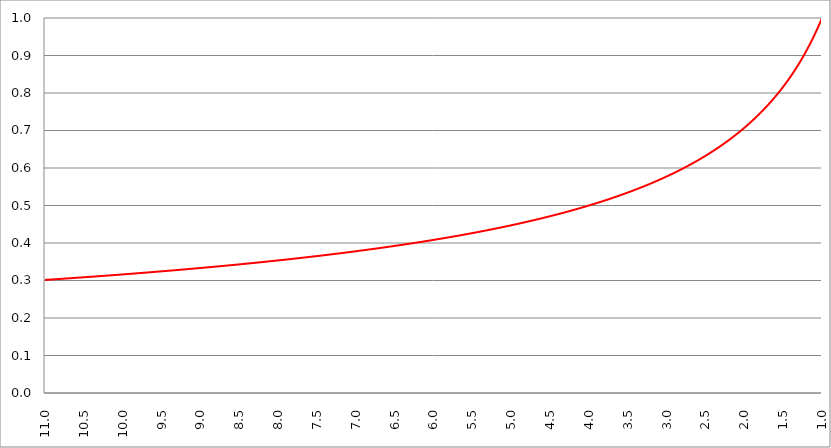
| Category | Series 1 | Series 0 | Series 2 |
|---|---|---|---|
| 11.0 | 0.302 |  |  |
| 10.995 | 0.302 |  |  |
| 10.99 | 0.302 |  |  |
| 10.985 | 0.302 |  |  |
| 10.98 | 0.302 |  |  |
| 10.975 | 0.302 |  |  |
| 10.97 | 0.302 |  |  |
| 10.96499999999999 | 0.302 |  |  |
| 10.96 | 0.302 |  |  |
| 10.955 | 0.302 |  |  |
| 10.95 | 0.302 |  |  |
| 10.945 | 0.302 |  |  |
| 10.94 | 0.302 |  |  |
| 10.93499999999999 | 0.302 |  |  |
| 10.92999999999999 | 0.302 |  |  |
| 10.92499999999999 | 0.303 |  |  |
| 10.91999999999999 | 0.303 |  |  |
| 10.91499999999999 | 0.303 |  |  |
| 10.90999999999999 | 0.303 |  |  |
| 10.90499999999999 | 0.303 |  |  |
| 10.89999999999998 | 0.303 |  |  |
| 10.89499999999998 | 0.303 |  |  |
| 10.88999999999998 | 0.303 |  |  |
| 10.88499999999998 | 0.303 |  |  |
| 10.87999999999998 | 0.303 |  |  |
| 10.87499999999998 | 0.303 |  |  |
| 10.86999999999998 | 0.303 |  |  |
| 10.86499999999998 | 0.303 |  |  |
| 10.85999999999998 | 0.303 |  |  |
| 10.85499999999998 | 0.304 |  |  |
| 10.84999999999998 | 0.304 |  |  |
| 10.84499999999998 | 0.304 |  |  |
| 10.83999999999997 | 0.304 |  |  |
| 10.83499999999997 | 0.304 |  |  |
| 10.82999999999997 | 0.304 |  |  |
| 10.82499999999997 | 0.304 |  |  |
| 10.81999999999997 | 0.304 |  |  |
| 10.81499999999997 | 0.304 |  |  |
| 10.80999999999997 | 0.304 |  |  |
| 10.80499999999997 | 0.304 |  |  |
| 10.79999999999997 | 0.304 |  |  |
| 10.79499999999997 | 0.304 |  |  |
| 10.78999999999997 | 0.304 |  |  |
| 10.78499999999997 | 0.305 |  |  |
| 10.77999999999997 | 0.305 |  |  |
| 10.77499999999996 | 0.305 |  |  |
| 10.76999999999996 | 0.305 |  |  |
| 10.76499999999996 | 0.305 |  |  |
| 10.75999999999996 | 0.305 |  |  |
| 10.75499999999996 | 0.305 |  |  |
| 10.74999999999996 | 0.305 |  |  |
| 10.74499999999996 | 0.305 |  |  |
| 10.73999999999996 | 0.305 |  |  |
| 10.73499999999996 | 0.305 |  |  |
| 10.72999999999996 | 0.305 |  |  |
| 10.72499999999996 | 0.305 |  |  |
| 10.71999999999996 | 0.305 |  |  |
| 10.71499999999996 | 0.305 |  |  |
| 10.70999999999995 | 0.306 |  |  |
| 10.70499999999995 | 0.306 |  |  |
| 10.69999999999995 | 0.306 |  |  |
| 10.69499999999995 | 0.306 |  |  |
| 10.68999999999995 | 0.306 |  |  |
| 10.68499999999995 | 0.306 |  |  |
| 10.67999999999995 | 0.306 |  |  |
| 10.67499999999995 | 0.306 |  |  |
| 10.66999999999995 | 0.306 |  |  |
| 10.66499999999995 | 0.306 |  |  |
| 10.65999999999995 | 0.306 |  |  |
| 10.65499999999995 | 0.306 |  |  |
| 10.64999999999995 | 0.306 |  |  |
| 10.64499999999994 | 0.306 |  |  |
| 10.63999999999994 | 0.307 |  |  |
| 10.63499999999994 | 0.307 |  |  |
| 10.62999999999994 | 0.307 |  |  |
| 10.62499999999994 | 0.307 |  |  |
| 10.61999999999994 | 0.307 |  |  |
| 10.61499999999994 | 0.307 |  |  |
| 10.60999999999994 | 0.307 |  |  |
| 10.60499999999994 | 0.307 |  |  |
| 10.59999999999994 | 0.307 |  |  |
| 10.59499999999994 | 0.307 |  |  |
| 10.58999999999994 | 0.307 |  |  |
| 10.58499999999994 | 0.307 |  |  |
| 10.57999999999993 | 0.307 |  |  |
| 10.57499999999993 | 0.308 |  |  |
| 10.56999999999993 | 0.308 |  |  |
| 10.56499999999993 | 0.308 |  |  |
| 10.55999999999993 | 0.308 |  |  |
| 10.55499999999993 | 0.308 |  |  |
| 10.54999999999993 | 0.308 |  |  |
| 10.54499999999993 | 0.308 |  |  |
| 10.53999999999993 | 0.308 |  |  |
| 10.53499999999993 | 0.308 |  |  |
| 10.52999999999993 | 0.308 |  |  |
| 10.52499999999993 | 0.308 |  |  |
| 10.51999999999992 | 0.308 |  |  |
| 10.51499999999992 | 0.308 |  |  |
| 10.50999999999992 | 0.308 |  |  |
| 10.50499999999992 | 0.309 |  |  |
| 10.49999999999992 | 0.309 |  |  |
| 10.49499999999992 | 0.309 |  |  |
| 10.48999999999992 | 0.309 |  |  |
| 10.48499999999992 | 0.309 |  |  |
| 10.47999999999992 | 0.309 |  |  |
| 10.47499999999992 | 0.309 |  |  |
| 10.46999999999992 | 0.309 |  |  |
| 10.46499999999992 | 0.309 |  |  |
| 10.45999999999992 | 0.309 |  |  |
| 10.45499999999991 | 0.309 |  |  |
| 10.44999999999991 | 0.309 |  |  |
| 10.44499999999991 | 0.309 |  |  |
| 10.43999999999991 | 0.309 |  |  |
| 10.43499999999991 | 0.31 |  |  |
| 10.42999999999991 | 0.31 |  |  |
| 10.42499999999991 | 0.31 |  |  |
| 10.41999999999991 | 0.31 |  |  |
| 10.41499999999991 | 0.31 |  |  |
| 10.40999999999991 | 0.31 |  |  |
| 10.40499999999991 | 0.31 |  |  |
| 10.39999999999991 | 0.31 |  |  |
| 10.39499999999991 | 0.31 |  |  |
| 10.3899999999999 | 0.31 |  |  |
| 10.3849999999999 | 0.31 |  |  |
| 10.3799999999999 | 0.31 |  |  |
| 10.3749999999999 | 0.31 |  |  |
| 10.3699999999999 | 0.311 |  |  |
| 10.3649999999999 | 0.311 |  |  |
| 10.3599999999999 | 0.311 |  |  |
| 10.3549999999999 | 0.311 |  |  |
| 10.3499999999999 | 0.311 |  |  |
| 10.3449999999999 | 0.311 |  |  |
| 10.3399999999999 | 0.311 |  |  |
| 10.3349999999999 | 0.311 |  |  |
| 10.3299999999999 | 0.311 |  |  |
| 10.32499999999989 | 0.311 |  |  |
| 10.31999999999989 | 0.311 |  |  |
| 10.31499999999989 | 0.311 |  |  |
| 10.3099999999999 | 0.311 |  |  |
| 10.3049999999999 | 0.312 |  |  |
| 10.2999999999999 | 0.312 |  |  |
| 10.29499999999989 | 0.312 |  |  |
| 10.28999999999989 | 0.312 |  |  |
| 10.28499999999989 | 0.312 |  |  |
| 10.27999999999989 | 0.312 |  |  |
| 10.27499999999989 | 0.312 |  |  |
| 10.26999999999989 | 0.312 |  |  |
| 10.26499999999989 | 0.312 |  |  |
| 10.25999999999988 | 0.312 |  |  |
| 10.25499999999988 | 0.312 |  |  |
| 10.24999999999988 | 0.312 |  |  |
| 10.24499999999988 | 0.312 |  |  |
| 10.23999999999988 | 0.313 |  |  |
| 10.23499999999988 | 0.313 |  |  |
| 10.22999999999988 | 0.313 |  |  |
| 10.22499999999988 | 0.313 |  |  |
| 10.21999999999988 | 0.313 |  |  |
| 10.21499999999988 | 0.313 |  |  |
| 10.20999999999988 | 0.313 |  |  |
| 10.20499999999988 | 0.313 |  |  |
| 10.19999999999987 | 0.313 |  |  |
| 10.19499999999987 | 0.313 |  |  |
| 10.18999999999987 | 0.313 |  |  |
| 10.18499999999987 | 0.313 |  |  |
| 10.17999999999987 | 0.313 |  |  |
| 10.17499999999987 | 0.313 |  |  |
| 10.16999999999987 | 0.314 |  |  |
| 10.16499999999987 | 0.314 |  |  |
| 10.15999999999987 | 0.314 |  |  |
| 10.15499999999987 | 0.314 |  |  |
| 10.14999999999987 | 0.314 |  |  |
| 10.14499999999987 | 0.314 |  |  |
| 10.13999999999987 | 0.314 |  |  |
| 10.13499999999986 | 0.314 |  |  |
| 10.12999999999986 | 0.314 |  |  |
| 10.12499999999986 | 0.314 |  |  |
| 10.11999999999986 | 0.314 |  |  |
| 10.11499999999986 | 0.314 |  |  |
| 10.10999999999986 | 0.315 |  |  |
| 10.10499999999986 | 0.315 |  |  |
| 10.09999999999986 | 0.315 |  |  |
| 10.09499999999986 | 0.315 |  |  |
| 10.08999999999986 | 0.315 |  |  |
| 10.08499999999986 | 0.315 |  |  |
| 10.07999999999986 | 0.315 |  |  |
| 10.07499999999986 | 0.315 |  |  |
| 10.06999999999985 | 0.315 |  |  |
| 10.06499999999985 | 0.315 |  |  |
| 10.05999999999985 | 0.315 |  |  |
| 10.05499999999985 | 0.315 |  |  |
| 10.04999999999985 | 0.315 |  |  |
| 10.04499999999985 | 0.316 |  |  |
| 10.03999999999985 | 0.316 |  |  |
| 10.03499999999985 | 0.316 |  |  |
| 10.02999999999985 | 0.316 |  |  |
| 10.02499999999985 | 0.316 |  |  |
| 10.01999999999985 | 0.316 |  |  |
| 10.01499999999985 | 0.316 |  |  |
| 10.00999999999985 | 0.316 |  |  |
| 10.00499999999984 | 0.316 |  |  |
| 9.999999999999844 | 0.316 |  |  |
| 9.994999999999841 | 0.316 |  |  |
| 9.98999999999984 | 0.316 |  |  |
| 9.98499999999984 | 0.316 |  |  |
| 9.97999999999984 | 0.317 |  |  |
| 9.97499999999984 | 0.317 |  |  |
| 9.969999999999837 | 0.317 |  |  |
| 9.964999999999838 | 0.317 |  |  |
| 9.959999999999837 | 0.317 |  |  |
| 9.954999999999837 | 0.317 |  |  |
| 9.949999999999836 | 0.317 |  |  |
| 9.944999999999835 | 0.317 |  |  |
| 9.939999999999834 | 0.317 |  |  |
| 9.934999999999834 | 0.317 |  |  |
| 9.929999999999833 | 0.317 |  |  |
| 9.92499999999983 | 0.317 |  |  |
| 9.91999999999983 | 0.318 |  |  |
| 9.91499999999983 | 0.318 |  |  |
| 9.90999999999983 | 0.318 |  |  |
| 9.904999999999829 | 0.318 |  |  |
| 9.899999999999826 | 0.318 |  |  |
| 9.894999999999827 | 0.318 |  |  |
| 9.889999999999826 | 0.318 |  |  |
| 9.884999999999826 | 0.318 |  |  |
| 9.879999999999823 | 0.318 |  |  |
| 9.874999999999824 | 0.318 |  |  |
| 9.869999999999823 | 0.318 |  |  |
| 9.864999999999823 | 0.318 |  |  |
| 9.85999999999982 | 0.318 |  |  |
| 9.85499999999982 | 0.319 |  |  |
| 9.84999999999982 | 0.319 |  |  |
| 9.84499999999982 | 0.319 |  |  |
| 9.839999999999819 | 0.319 |  |  |
| 9.834999999999818 | 0.319 |  |  |
| 9.829999999999817 | 0.319 |  |  |
| 9.824999999999816 | 0.319 |  |  |
| 9.819999999999816 | 0.319 |  |  |
| 9.814999999999815 | 0.319 |  |  |
| 9.809999999999812 | 0.319 |  |  |
| 9.804999999999813 | 0.319 |  |  |
| 9.799999999999812 | 0.319 |  |  |
| 9.794999999999812 | 0.32 |  |  |
| 9.78999999999981 | 0.32 |  |  |
| 9.78499999999981 | 0.32 |  |  |
| 9.77999999999981 | 0.32 |  |  |
| 9.774999999999809 | 0.32 |  |  |
| 9.769999999999808 | 0.32 |  |  |
| 9.764999999999807 | 0.32 |  |  |
| 9.759999999999806 | 0.32 |  |  |
| 9.754999999999805 | 0.32 |  |  |
| 9.749999999999805 | 0.32 |  |  |
| 9.744999999999804 | 0.32 |  |  |
| 9.739999999999803 | 0.32 |  |  |
| 9.734999999999802 | 0.321 |  |  |
| 9.729999999999801 | 0.321 |  |  |
| 9.7249999999998 | 0.321 |  |  |
| 9.7199999999998 | 0.321 |  |  |
| 9.7149999999998 | 0.321 |  |  |
| 9.709999999999798 | 0.321 |  |  |
| 9.704999999999798 | 0.321 |  |  |
| 9.699999999999797 | 0.321 |  |  |
| 9.694999999999794 | 0.321 |  |  |
| 9.689999999999795 | 0.321 |  |  |
| 9.684999999999794 | 0.321 |  |  |
| 9.679999999999794 | 0.321 |  |  |
| 9.674999999999793 | 0.321 |  |  |
| 9.66999999999979 | 0.322 |  |  |
| 9.66499999999979 | 0.322 |  |  |
| 9.65999999999979 | 0.322 |  |  |
| 9.65499999999979 | 0.322 |  |  |
| 9.649999999999787 | 0.322 |  |  |
| 9.644999999999788 | 0.322 |  |  |
| 9.639999999999787 | 0.322 |  |  |
| 9.634999999999787 | 0.322 |  |  |
| 9.629999999999786 | 0.322 |  |  |
| 9.624999999999785 | 0.322 |  |  |
| 9.619999999999784 | 0.322 |  |  |
| 9.614999999999783 | 0.322 |  |  |
| 9.609999999999783 | 0.323 |  |  |
| 9.60499999999978 | 0.323 |  |  |
| 9.59999999999978 | 0.323 |  |  |
| 9.59499999999978 | 0.323 |  |  |
| 9.58999999999978 | 0.323 |  |  |
| 9.584999999999779 | 0.323 |  |  |
| 9.579999999999778 | 0.323 |  |  |
| 9.574999999999777 | 0.323 |  |  |
| 9.569999999999776 | 0.323 |  |  |
| 9.564999999999776 | 0.323 |  |  |
| 9.559999999999773 | 0.323 |  |  |
| 9.554999999999774 | 0.324 |  |  |
| 9.549999999999773 | 0.324 |  |  |
| 9.544999999999773 | 0.324 |  |  |
| 9.539999999999772 | 0.324 |  |  |
| 9.534999999999771 | 0.324 |  |  |
| 9.52999999999977 | 0.324 |  |  |
| 9.52499999999977 | 0.324 |  |  |
| 9.519999999999769 | 0.324 |  |  |
| 9.514999999999768 | 0.324 |  |  |
| 9.509999999999767 | 0.324 |  |  |
| 9.504999999999766 | 0.324 |  |  |
| 9.499999999999766 | 0.324 |  |  |
| 9.494999999999765 | 0.325 |  |  |
| 9.489999999999762 | 0.325 |  |  |
| 9.484999999999763 | 0.325 |  |  |
| 9.47999999999976 | 0.325 |  |  |
| 9.47499999999976 | 0.325 |  |  |
| 9.46999999999976 | 0.325 |  |  |
| 9.46499999999976 | 0.325 |  |  |
| 9.45999999999976 | 0.325 |  |  |
| 9.454999999999758 | 0.325 |  |  |
| 9.449999999999758 | 0.325 |  |  |
| 9.444999999999757 | 0.325 |  |  |
| 9.439999999999756 | 0.325 |  |  |
| 9.434999999999755 | 0.326 |  |  |
| 9.429999999999755 | 0.326 |  |  |
| 9.424999999999754 | 0.326 |  |  |
| 9.419999999999751 | 0.326 |  |  |
| 9.414999999999752 | 0.326 |  |  |
| 9.40999999999975 | 0.326 |  |  |
| 9.40499999999975 | 0.326 |  |  |
| 9.39999999999975 | 0.326 |  |  |
| 9.39499999999975 | 0.326 |  |  |
| 9.389999999999748 | 0.326 |  |  |
| 9.384999999999748 | 0.326 |  |  |
| 9.379999999999747 | 0.327 |  |  |
| 9.374999999999744 | 0.327 |  |  |
| 9.369999999999745 | 0.327 |  |  |
| 9.364999999999744 | 0.327 |  |  |
| 9.35999999999974 | 0.327 |  |  |
| 9.35499999999974 | 0.327 |  |  |
| 9.34999999999974 | 0.327 |  |  |
| 9.34499999999974 | 0.327 |  |  |
| 9.33999999999974 | 0.327 |  |  |
| 9.33499999999974 | 0.327 |  |  |
| 9.329999999999737 | 0.327 |  |  |
| 9.324999999999738 | 0.327 |  |  |
| 9.319999999999737 | 0.328 |  |  |
| 9.314999999999737 | 0.328 |  |  |
| 9.309999999999736 | 0.328 |  |  |
| 9.304999999999733 | 0.328 |  |  |
| 9.299999999999734 | 0.328 |  |  |
| 9.294999999999733 | 0.328 |  |  |
| 9.289999999999733 | 0.328 |  |  |
| 9.28499999999973 | 0.328 |  |  |
| 9.27999999999973 | 0.328 |  |  |
| 9.27499999999973 | 0.328 |  |  |
| 9.26999999999973 | 0.328 |  |  |
| 9.264999999999729 | 0.329 |  |  |
| 9.259999999999726 | 0.329 |  |  |
| 9.254999999999727 | 0.329 |  |  |
| 9.249999999999726 | 0.329 |  |  |
| 9.244999999999726 | 0.329 |  |  |
| 9.239999999999725 | 0.329 |  |  |
| 9.234999999999724 | 0.329 |  |  |
| 9.229999999999723 | 0.329 |  |  |
| 9.224999999999723 | 0.329 |  |  |
| 9.219999999999722 | 0.329 |  |  |
| 9.214999999999721 | 0.329 |  |  |
| 9.20999999999972 | 0.33 |  |  |
| 9.20499999999972 | 0.33 |  |  |
| 9.199999999999719 | 0.33 |  |  |
| 9.194999999999718 | 0.33 |  |  |
| 9.189999999999717 | 0.33 |  |  |
| 9.184999999999716 | 0.33 |  |  |
| 9.179999999999715 | 0.33 |  |  |
| 9.174999999999715 | 0.33 |  |  |
| 9.169999999999712 | 0.33 |  |  |
| 9.164999999999713 | 0.33 |  |  |
| 9.15999999999971 | 0.33 |  |  |
| 9.15499999999971 | 0.33 |  |  |
| 9.14999999999971 | 0.331 |  |  |
| 9.14499999999971 | 0.331 |  |  |
| 9.13999999999971 | 0.331 |  |  |
| 9.134999999999708 | 0.331 |  |  |
| 9.129999999999708 | 0.331 |  |  |
| 9.124999999999707 | 0.331 |  |  |
| 9.119999999999706 | 0.331 |  |  |
| 9.114999999999705 | 0.331 |  |  |
| 9.109999999999705 | 0.331 |  |  |
| 9.104999999999704 | 0.331 |  |  |
| 9.099999999999701 | 0.331 |  |  |
| 9.094999999999702 | 0.332 |  |  |
| 9.0899999999997 | 0.332 |  |  |
| 9.0849999999997 | 0.332 |  |  |
| 9.0799999999997 | 0.332 |  |  |
| 9.0749999999997 | 0.332 |  |  |
| 9.069999999999698 | 0.332 |  |  |
| 9.064999999999698 | 0.332 |  |  |
| 9.059999999999697 | 0.332 |  |  |
| 9.054999999999694 | 0.332 |  |  |
| 9.049999999999695 | 0.332 |  |  |
| 9.044999999999694 | 0.333 |  |  |
| 9.039999999999694 | 0.333 |  |  |
| 9.034999999999693 | 0.333 |  |  |
| 9.02999999999969 | 0.333 |  |  |
| 9.02499999999969 | 0.333 |  |  |
| 9.01999999999969 | 0.333 |  |  |
| 9.01499999999969 | 0.333 |  |  |
| 9.009999999999687 | 0.333 |  |  |
| 9.004999999999688 | 0.333 |  |  |
| 8.999999999999687 | 0.333 |  |  |
| 8.994999999999687 | 0.333 |  |  |
| 8.989999999999686 | 0.334 |  |  |
| 8.984999999999683 | 0.334 |  |  |
| 8.979999999999684 | 0.334 |  |  |
| 8.974999999999683 | 0.334 |  |  |
| 8.96999999999968 | 0.334 |  |  |
| 8.96499999999968 | 0.334 |  |  |
| 8.95999999999968 | 0.334 |  |  |
| 8.95499999999968 | 0.334 |  |  |
| 8.94999999999968 | 0.334 |  |  |
| 8.944999999999679 | 0.334 |  |  |
| 8.939999999999676 | 0.334 |  |  |
| 8.934999999999677 | 0.335 |  |  |
| 8.929999999999676 | 0.335 |  |  |
| 8.924999999999676 | 0.335 |  |  |
| 8.919999999999675 | 0.335 |  |  |
| 8.914999999999674 | 0.335 |  |  |
| 8.909999999999673 | 0.335 |  |  |
| 8.904999999999673 | 0.335 |  |  |
| 8.89999999999967 | 0.335 |  |  |
| 8.89499999999967 | 0.335 |  |  |
| 8.88999999999967 | 0.335 |  |  |
| 8.88499999999967 | 0.335 |  |  |
| 8.879999999999669 | 0.336 |  |  |
| 8.874999999999668 | 0.336 |  |  |
| 8.869999999999665 | 0.336 |  |  |
| 8.864999999999666 | 0.336 |  |  |
| 8.859999999999665 | 0.336 |  |  |
| 8.854999999999665 | 0.336 |  |  |
| 8.849999999999662 | 0.336 |  |  |
| 8.844999999999663 | 0.336 |  |  |
| 8.83999999999966 | 0.336 |  |  |
| 8.83499999999966 | 0.336 |  |  |
| 8.82999999999966 | 0.337 |  |  |
| 8.82499999999966 | 0.337 |  |  |
| 8.81999999999966 | 0.337 |  |  |
| 8.814999999999658 | 0.337 |  |  |
| 8.809999999999658 | 0.337 |  |  |
| 8.804999999999657 | 0.337 |  |  |
| 8.799999999999656 | 0.337 |  |  |
| 8.794999999999655 | 0.337 |  |  |
| 8.789999999999655 | 0.337 |  |  |
| 8.784999999999654 | 0.337 |  |  |
| 8.779999999999651 | 0.337 |  |  |
| 8.774999999999652 | 0.338 |  |  |
| 8.76999999999965 | 0.338 |  |  |
| 8.76499999999965 | 0.338 |  |  |
| 8.75999999999965 | 0.338 |  |  |
| 8.754999999999647 | 0.338 |  |  |
| 8.749999999999648 | 0.338 |  |  |
| 8.744999999999647 | 0.338 |  |  |
| 8.739999999999647 | 0.338 |  |  |
| 8.734999999999644 | 0.338 |  |  |
| 8.729999999999645 | 0.338 |  |  |
| 8.724999999999644 | 0.339 |  |  |
| 8.719999999999644 | 0.339 |  |  |
| 8.714999999999643 | 0.339 |  |  |
| 8.70999999999964 | 0.339 |  |  |
| 8.70499999999964 | 0.339 |  |  |
| 8.69999999999964 | 0.339 |  |  |
| 8.69499999999964 | 0.339 |  |  |
| 8.689999999999637 | 0.339 |  |  |
| 8.684999999999638 | 0.339 |  |  |
| 8.679999999999637 | 0.339 |  |  |
| 8.674999999999637 | 0.34 |  |  |
| 8.669999999999636 | 0.34 |  |  |
| 8.664999999999633 | 0.34 |  |  |
| 8.659999999999634 | 0.34 |  |  |
| 8.654999999999633 | 0.34 |  |  |
| 8.649999999999633 | 0.34 |  |  |
| 8.644999999999632 | 0.34 |  |  |
| 8.63999999999963 | 0.34 |  |  |
| 8.63499999999963 | 0.34 |  |  |
| 8.62999999999963 | 0.34 |  |  |
| 8.624999999999629 | 0.341 |  |  |
| 8.619999999999626 | 0.341 |  |  |
| 8.614999999999627 | 0.341 |  |  |
| 8.609999999999626 | 0.341 |  |  |
| 8.604999999999626 | 0.341 |  |  |
| 8.599999999999625 | 0.341 |  |  |
| 8.594999999999624 | 0.341 |  |  |
| 8.589999999999623 | 0.341 |  |  |
| 8.584999999999622 | 0.341 |  |  |
| 8.57999999999962 | 0.341 |  |  |
| 8.57499999999962 | 0.341 |  |  |
| 8.56999999999962 | 0.342 |  |  |
| 8.56499999999962 | 0.342 |  |  |
| 8.559999999999619 | 0.342 |  |  |
| 8.554999999999618 | 0.342 |  |  |
| 8.549999999999617 | 0.342 |  |  |
| 8.544999999999616 | 0.342 |  |  |
| 8.539999999999615 | 0.342 |  |  |
| 8.534999999999615 | 0.342 |  |  |
| 8.529999999999612 | 0.342 |  |  |
| 8.524999999999613 | 0.342 |  |  |
| 8.51999999999961 | 0.343 |  |  |
| 8.51499999999961 | 0.343 |  |  |
| 8.50999999999961 | 0.343 |  |  |
| 8.50499999999961 | 0.343 |  |  |
| 8.49999999999961 | 0.343 |  |  |
| 8.494999999999608 | 0.343 |  |  |
| 8.489999999999608 | 0.343 |  |  |
| 8.484999999999607 | 0.343 |  |  |
| 8.479999999999606 | 0.343 |  |  |
| 8.474999999999605 | 0.344 |  |  |
| 8.469999999999605 | 0.344 |  |  |
| 8.464999999999604 | 0.344 |  |  |
| 8.4599999999996 | 0.344 |  |  |
| 8.4549999999996 | 0.344 |  |  |
| 8.4499999999996 | 0.344 |  |  |
| 8.4449999999996 | 0.344 |  |  |
| 8.4399999999996 | 0.344 |  |  |
| 8.4349999999996 | 0.344 |  |  |
| 8.429999999999598 | 0.344 |  |  |
| 8.424999999999597 | 0.345 |  |  |
| 8.419999999999597 | 0.345 |  |  |
| 8.414999999999594 | 0.345 |  |  |
| 8.409999999999595 | 0.345 |  |  |
| 8.404999999999594 | 0.345 |  |  |
| 8.399999999999594 | 0.345 |  |  |
| 8.394999999999593 | 0.345 |  |  |
| 8.38999999999959 | 0.345 |  |  |
| 8.38499999999959 | 0.345 |  |  |
| 8.37999999999959 | 0.345 |  |  |
| 8.37499999999959 | 0.346 |  |  |
| 8.369999999999589 | 0.346 |  |  |
| 8.364999999999588 | 0.346 |  |  |
| 8.359999999999587 | 0.346 |  |  |
| 8.354999999999587 | 0.346 |  |  |
| 8.349999999999586 | 0.346 |  |  |
| 8.344999999999585 | 0.346 |  |  |
| 8.339999999999584 | 0.346 |  |  |
| 8.334999999999583 | 0.346 |  |  |
| 8.329999999999583 | 0.346 |  |  |
| 8.324999999999582 | 0.347 |  |  |
| 8.31999999999958 | 0.347 |  |  |
| 8.31499999999958 | 0.347 |  |  |
| 8.30999999999958 | 0.347 |  |  |
| 8.304999999999579 | 0.347 |  |  |
| 8.299999999999578 | 0.347 |  |  |
| 8.294999999999577 | 0.347 |  |  |
| 8.289999999999576 | 0.347 |  |  |
| 8.284999999999576 | 0.347 |  |  |
| 8.279999999999575 | 0.348 |  |  |
| 8.274999999999574 | 0.348 |  |  |
| 8.269999999999573 | 0.348 |  |  |
| 8.264999999999572 | 0.348 |  |  |
| 8.259999999999572 | 0.348 |  |  |
| 8.254999999999571 | 0.348 |  |  |
| 8.24999999999957 | 0.348 |  |  |
| 8.24499999999957 | 0.348 |  |  |
| 8.239999999999569 | 0.348 |  |  |
| 8.234999999999568 | 0.348 |  |  |
| 8.229999999999567 | 0.349 |  |  |
| 8.224999999999566 | 0.349 |  |  |
| 8.219999999999565 | 0.349 |  |  |
| 8.214999999999565 | 0.349 |  |  |
| 8.209999999999564 | 0.349 |  |  |
| 8.204999999999563 | 0.349 |  |  |
| 8.199999999999562 | 0.349 |  |  |
| 8.194999999999562 | 0.349 |  |  |
| 8.18999999999956 | 0.349 |  |  |
| 8.18499999999956 | 0.35 |  |  |
| 8.17999999999956 | 0.35 |  |  |
| 8.174999999999558 | 0.35 |  |  |
| 8.169999999999558 | 0.35 |  |  |
| 8.164999999999557 | 0.35 |  |  |
| 8.159999999999556 | 0.35 |  |  |
| 8.154999999999555 | 0.35 |  |  |
| 8.149999999999554 | 0.35 |  |  |
| 8.144999999999554 | 0.35 |  |  |
| 8.139999999999553 | 0.35 |  |  |
| 8.134999999999552 | 0.351 |  |  |
| 8.129999999999551 | 0.351 |  |  |
| 8.12499999999955 | 0.351 |  |  |
| 8.11999999999955 | 0.351 |  |  |
| 8.11499999999955 | 0.351 |  |  |
| 8.109999999999548 | 0.351 |  |  |
| 8.104999999999547 | 0.351 |  |  |
| 8.099999999999547 | 0.351 |  |  |
| 8.094999999999544 | 0.351 |  |  |
| 8.089999999999545 | 0.352 |  |  |
| 8.084999999999544 | 0.352 |  |  |
| 8.079999999999544 | 0.352 |  |  |
| 8.074999999999543 | 0.352 |  |  |
| 8.06999999999954 | 0.352 |  |  |
| 8.06499999999954 | 0.352 |  |  |
| 8.05999999999954 | 0.352 |  |  |
| 8.05499999999954 | 0.352 |  |  |
| 8.049999999999539 | 0.352 |  |  |
| 8.044999999999538 | 0.353 |  |  |
| 8.039999999999537 | 0.353 |  |  |
| 8.034999999999537 | 0.353 |  |  |
| 8.029999999999536 | 0.353 |  |  |
| 8.024999999999535 | 0.353 |  |  |
| 8.019999999999534 | 0.353 |  |  |
| 8.014999999999533 | 0.353 |  |  |
| 8.009999999999533 | 0.353 |  |  |
| 8.004999999999532 | 0.353 |  |  |
| 7.999999999999531 | 0.354 |  |  |
| 7.994999999999532 | 0.354 |  |  |
| 7.989999999999532 | 0.354 |  |  |
| 7.984999999999532 | 0.354 |  |  |
| 7.979999999999532 | 0.354 |  |  |
| 7.974999999999532 | 0.354 |  |  |
| 7.969999999999532 | 0.354 |  |  |
| 7.964999999999533 | 0.354 |  |  |
| 7.959999999999532 | 0.354 |  |  |
| 7.954999999999533 | 0.355 |  |  |
| 7.949999999999532 | 0.355 |  |  |
| 7.944999999999533 | 0.355 |  |  |
| 7.939999999999533 | 0.355 |  |  |
| 7.934999999999533 | 0.355 |  |  |
| 7.929999999999533 | 0.355 |  |  |
| 7.924999999999534 | 0.355 |  |  |
| 7.919999999999533 | 0.355 |  |  |
| 7.914999999999534 | 0.355 |  |  |
| 7.909999999999533 | 0.356 |  |  |
| 7.904999999999534 | 0.356 |  |  |
| 7.899999999999534 | 0.356 |  |  |
| 7.894999999999534 | 0.356 |  |  |
| 7.889999999999534 | 0.356 |  |  |
| 7.884999999999534 | 0.356 |  |  |
| 7.879999999999534 | 0.356 |  |  |
| 7.874999999999534 | 0.356 |  |  |
| 7.869999999999534 | 0.356 |  |  |
| 7.864999999999535 | 0.357 |  |  |
| 7.859999999999534 | 0.357 |  |  |
| 7.854999999999535 | 0.357 |  |  |
| 7.849999999999535 | 0.357 |  |  |
| 7.844999999999535 | 0.357 |  |  |
| 7.839999999999535 | 0.357 |  |  |
| 7.834999999999535 | 0.357 |  |  |
| 7.829999999999535 | 0.357 |  |  |
| 7.824999999999536 | 0.357 |  |  |
| 7.819999999999535 | 0.358 |  |  |
| 7.814999999999536 | 0.358 |  |  |
| 7.809999999999535 | 0.358 |  |  |
| 7.804999999999536 | 0.358 |  |  |
| 7.799999999999536 | 0.358 |  |  |
| 7.794999999999536 | 0.358 |  |  |
| 7.789999999999536 | 0.358 |  |  |
| 7.784999999999536 | 0.358 |  |  |
| 7.779999999999536 | 0.359 |  |  |
| 7.774999999999536 | 0.359 |  |  |
| 7.769999999999536 | 0.359 |  |  |
| 7.764999999999537 | 0.359 |  |  |
| 7.759999999999536 | 0.359 |  |  |
| 7.754999999999537 | 0.359 |  |  |
| 7.749999999999537 | 0.359 |  |  |
| 7.744999999999537 | 0.359 |  |  |
| 7.739999999999537 | 0.359 |  |  |
| 7.734999999999537 | 0.36 |  |  |
| 7.729999999999537 | 0.36 |  |  |
| 7.724999999999538 | 0.36 |  |  |
| 7.719999999999537 | 0.36 |  |  |
| 7.714999999999538 | 0.36 |  |  |
| 7.709999999999538 | 0.36 |  |  |
| 7.704999999999538 | 0.36 |  |  |
| 7.699999999999538 | 0.36 |  |  |
| 7.694999999999538 | 0.36 |  |  |
| 7.689999999999538 | 0.361 |  |  |
| 7.684999999999539 | 0.361 |  |  |
| 7.679999999999538 | 0.361 |  |  |
| 7.674999999999539 | 0.361 |  |  |
| 7.669999999999539 | 0.361 |  |  |
| 7.664999999999539 | 0.361 |  |  |
| 7.65999999999954 | 0.361 |  |  |
| 7.654999999999539 | 0.361 |  |  |
| 7.64999999999954 | 0.362 |  |  |
| 7.644999999999539 | 0.362 |  |  |
| 7.63999999999954 | 0.362 |  |  |
| 7.63499999999954 | 0.362 |  |  |
| 7.62999999999954 | 0.362 |  |  |
| 7.62499999999954 | 0.362 |  |  |
| 7.61999999999954 | 0.362 |  |  |
| 7.61499999999954 | 0.362 |  |  |
| 7.60999999999954 | 0.362 |  |  |
| 7.60499999999954 | 0.363 |  |  |
| 7.59999999999954 | 0.363 |  |  |
| 7.594999999999541 | 0.363 |  |  |
| 7.58999999999954 | 0.363 |  |  |
| 7.584999999999541 | 0.363 |  |  |
| 7.57999999999954 | 0.363 |  |  |
| 7.574999999999541 | 0.363 |  |  |
| 7.569999999999541 | 0.363 |  |  |
| 7.564999999999541 | 0.364 |  |  |
| 7.559999999999541 | 0.364 |  |  |
| 7.554999999999541 | 0.364 |  |  |
| 7.549999999999541 | 0.364 |  |  |
| 7.544999999999542 | 0.364 |  |  |
| 7.539999999999541 | 0.364 |  |  |
| 7.534999999999542 | 0.364 |  |  |
| 7.529999999999542 | 0.364 |  |  |
| 7.524999999999542 | 0.365 |  |  |
| 7.519999999999542 | 0.365 |  |  |
| 7.514999999999542 | 0.365 |  |  |
| 7.509999999999542 | 0.365 |  |  |
| 7.504999999999542 | 0.365 |  |  |
| 7.499999999999542 | 0.365 |  |  |
| 7.494999999999543 | 0.365 |  |  |
| 7.489999999999542 | 0.365 |  |  |
| 7.484999999999543 | 0.366 |  |  |
| 7.479999999999542 | 0.366 |  |  |
| 7.474999999999543 | 0.366 |  |  |
| 7.469999999999543 | 0.366 |  |  |
| 7.464999999999543 | 0.366 |  |  |
| 7.459999999999543 | 0.366 |  |  |
| 7.454999999999544 | 0.366 |  |  |
| 7.449999999999543 | 0.366 |  |  |
| 7.444999999999544 | 0.366 |  |  |
| 7.439999999999543 | 0.367 |  |  |
| 7.434999999999544 | 0.367 |  |  |
| 7.429999999999544 | 0.367 |  |  |
| 7.424999999999544 | 0.367 |  |  |
| 7.419999999999544 | 0.367 |  |  |
| 7.414999999999544 | 0.367 |  |  |
| 7.409999999999544 | 0.367 |  |  |
| 7.404999999999544 | 0.367 |  |  |
| 7.399999999999544 | 0.368 |  |  |
| 7.394999999999545 | 0.368 |  |  |
| 7.389999999999544 | 0.368 |  |  |
| 7.384999999999545 | 0.368 |  |  |
| 7.379999999999545 | 0.368 |  |  |
| 7.374999999999545 | 0.368 |  |  |
| 7.369999999999545 | 0.368 |  |  |
| 7.364999999999545 | 0.368 |  |  |
| 7.359999999999545 | 0.369 |  |  |
| 7.354999999999546 | 0.369 |  |  |
| 7.349999999999545 | 0.369 |  |  |
| 7.344999999999546 | 0.369 |  |  |
| 7.339999999999545 | 0.369 |  |  |
| 7.334999999999546 | 0.369 |  |  |
| 7.329999999999546 | 0.369 |  |  |
| 7.324999999999546 | 0.369 |  |  |
| 7.319999999999546 | 0.37 |  |  |
| 7.314999999999546 | 0.37 |  |  |
| 7.309999999999546 | 0.37 |  |  |
| 7.304999999999547 | 0.37 |  |  |
| 7.299999999999546 | 0.37 |  |  |
| 7.294999999999547 | 0.37 |  |  |
| 7.289999999999547 | 0.37 |  |  |
| 7.284999999999547 | 0.37 |  |  |
| 7.279999999999547 | 0.371 |  |  |
| 7.274999999999547 | 0.371 |  |  |
| 7.269999999999547 | 0.371 |  |  |
| 7.264999999999548 | 0.371 |  |  |
| 7.259999999999547 | 0.371 |  |  |
| 7.254999999999548 | 0.371 |  |  |
| 7.249999999999547 | 0.371 |  |  |
| 7.244999999999548 | 0.372 |  |  |
| 7.239999999999548 | 0.372 |  |  |
| 7.234999999999548 | 0.372 |  |  |
| 7.229999999999548 | 0.372 |  |  |
| 7.224999999999548 | 0.372 |  |  |
| 7.219999999999548 | 0.372 |  |  |
| 7.214999999999549 | 0.372 |  |  |
| 7.209999999999548 | 0.372 |  |  |
| 7.204999999999549 | 0.373 |  |  |
| 7.199999999999549 | 0.373 |  |  |
| 7.194999999999549 | 0.373 |  |  |
| 7.18999999999955 | 0.373 |  |  |
| 7.184999999999549 | 0.373 |  |  |
| 7.17999999999955 | 0.373 |  |  |
| 7.17499999999955 | 0.373 |  |  |
| 7.16999999999955 | 0.373 |  |  |
| 7.16499999999955 | 0.374 |  |  |
| 7.15999999999955 | 0.374 |  |  |
| 7.15499999999955 | 0.374 |  |  |
| 7.14999999999955 | 0.374 |  |  |
| 7.14499999999955 | 0.374 |  |  |
| 7.13999999999955 | 0.374 |  |  |
| 7.13499999999955 | 0.374 |  |  |
| 7.12999999999955 | 0.375 |  |  |
| 7.124999999999551 | 0.375 |  |  |
| 7.119999999999551 | 0.375 |  |  |
| 7.114999999999551 | 0.375 |  |  |
| 7.109999999999551 | 0.375 |  |  |
| 7.104999999999551 | 0.375 |  |  |
| 7.099999999999551 | 0.375 |  |  |
| 7.094999999999551 | 0.375 |  |  |
| 7.089999999999551 | 0.376 |  |  |
| 7.084999999999551 | 0.376 |  |  |
| 7.079999999999551 | 0.376 |  |  |
| 7.074999999999552 | 0.376 |  |  |
| 7.069999999999552 | 0.376 |  |  |
| 7.064999999999552 | 0.376 |  |  |
| 7.059999999999552 | 0.376 |  |  |
| 7.054999999999552 | 0.376 |  |  |
| 7.049999999999552 | 0.377 |  |  |
| 7.044999999999552 | 0.377 |  |  |
| 7.039999999999552 | 0.377 |  |  |
| 7.034999999999552 | 0.377 |  |  |
| 7.029999999999553 | 0.377 |  |  |
| 7.024999999999553 | 0.377 |  |  |
| 7.019999999999553 | 0.377 |  |  |
| 7.014999999999553 | 0.378 |  |  |
| 7.009999999999553 | 0.378 |  |  |
| 7.004999999999553 | 0.378 |  |  |
| 6.999999999999553 | 0.378 |  |  |
| 6.994999999999553 | 0.378 |  |  |
| 6.989999999999553 | 0.378 |  |  |
| 6.984999999999554 | 0.378 |  |  |
| 6.979999999999553 | 0.379 |  |  |
| 6.974999999999554 | 0.379 |  |  |
| 6.969999999999554 | 0.379 |  |  |
| 6.964999999999554 | 0.379 |  |  |
| 6.959999999999554 | 0.379 |  |  |
| 6.954999999999554 | 0.379 |  |  |
| 6.949999999999554 | 0.379 |  |  |
| 6.944999999999554 | 0.379 |  |  |
| 6.939999999999554 | 0.38 |  |  |
| 6.934999999999554 | 0.38 |  |  |
| 6.929999999999554 | 0.38 |  |  |
| 6.924999999999555 | 0.38 |  |  |
| 6.919999999999554 | 0.38 |  |  |
| 6.914999999999555 | 0.38 |  |  |
| 6.909999999999555 | 0.38 |  |  |
| 6.904999999999555 | 0.381 |  |  |
| 6.899999999999555 | 0.381 |  |  |
| 6.894999999999555 | 0.381 |  |  |
| 6.889999999999555 | 0.381 |  |  |
| 6.884999999999556 | 0.381 |  |  |
| 6.879999999999555 | 0.381 |  |  |
| 6.874999999999556 | 0.381 |  |  |
| 6.869999999999556 | 0.382 |  |  |
| 6.864999999999556 | 0.382 |  |  |
| 6.859999999999556 | 0.382 |  |  |
| 6.854999999999556 | 0.382 |  |  |
| 6.849999999999556 | 0.382 |  |  |
| 6.844999999999556 | 0.382 |  |  |
| 6.839999999999556 | 0.382 |  |  |
| 6.834999999999557 | 0.382 |  |  |
| 6.829999999999557 | 0.383 |  |  |
| 6.824999999999557 | 0.383 |  |  |
| 6.819999999999557 | 0.383 |  |  |
| 6.814999999999557 | 0.383 |  |  |
| 6.809999999999557 | 0.383 |  |  |
| 6.804999999999557 | 0.383 |  |  |
| 6.799999999999557 | 0.383 |  |  |
| 6.794999999999558 | 0.384 |  |  |
| 6.789999999999557 | 0.384 |  |  |
| 6.784999999999558 | 0.384 |  |  |
| 6.779999999999557 | 0.384 |  |  |
| 6.774999999999558 | 0.384 |  |  |
| 6.769999999999558 | 0.384 |  |  |
| 6.764999999999558 | 0.384 |  |  |
| 6.759999999999558 | 0.385 |  |  |
| 6.754999999999558 | 0.385 |  |  |
| 6.749999999999558 | 0.385 |  |  |
| 6.744999999999559 | 0.385 |  |  |
| 6.739999999999558 | 0.385 |  |  |
| 6.734999999999559 | 0.385 |  |  |
| 6.729999999999559 | 0.385 |  |  |
| 6.724999999999559 | 0.386 |  |  |
| 6.71999999999956 | 0.386 |  |  |
| 6.714999999999559 | 0.386 |  |  |
| 6.70999999999956 | 0.386 |  |  |
| 6.704999999999559 | 0.386 |  |  |
| 6.69999999999956 | 0.386 |  |  |
| 6.69499999999956 | 0.386 |  |  |
| 6.68999999999956 | 0.387 |  |  |
| 6.68499999999956 | 0.387 |  |  |
| 6.67999999999956 | 0.387 |  |  |
| 6.67499999999956 | 0.387 |  |  |
| 6.66999999999956 | 0.387 |  |  |
| 6.66499999999956 | 0.387 |  |  |
| 6.65999999999956 | 0.387 |  |  |
| 6.654999999999561 | 0.388 |  |  |
| 6.64999999999956 | 0.388 |  |  |
| 6.644999999999561 | 0.388 |  |  |
| 6.63999999999956 | 0.388 |  |  |
| 6.634999999999561 | 0.388 |  |  |
| 6.629999999999561 | 0.388 |  |  |
| 6.624999999999561 | 0.389 |  |  |
| 6.619999999999561 | 0.389 |  |  |
| 6.614999999999561 | 0.389 |  |  |
| 6.609999999999561 | 0.389 |  |  |
| 6.604999999999562 | 0.389 |  |  |
| 6.599999999999561 | 0.389 |  |  |
| 6.594999999999562 | 0.389 |  |  |
| 6.589999999999561 | 0.39 |  |  |
| 6.584999999999562 | 0.39 |  |  |
| 6.579999999999562 | 0.39 |  |  |
| 6.574999999999562 | 0.39 |  |  |
| 6.569999999999562 | 0.39 |  |  |
| 6.564999999999563 | 0.39 |  |  |
| 6.559999999999562 | 0.39 |  |  |
| 6.554999999999563 | 0.391 |  |  |
| 6.549999999999562 | 0.391 |  |  |
| 6.544999999999563 | 0.391 |  |  |
| 6.539999999999563 | 0.391 |  |  |
| 6.534999999999563 | 0.391 |  |  |
| 6.529999999999563 | 0.391 |  |  |
| 6.524999999999563 | 0.391 |  |  |
| 6.519999999999563 | 0.392 |  |  |
| 6.514999999999564 | 0.392 |  |  |
| 6.509999999999563 | 0.392 |  |  |
| 6.504999999999564 | 0.392 |  |  |
| 6.499999999999563 | 0.392 |  |  |
| 6.494999999999564 | 0.392 |  |  |
| 6.489999999999564 | 0.393 |  |  |
| 6.484999999999564 | 0.393 |  |  |
| 6.479999999999564 | 0.393 |  |  |
| 6.474999999999564 | 0.393 |  |  |
| 6.469999999999564 | 0.393 |  |  |
| 6.464999999999564 | 0.393 |  |  |
| 6.459999999999564 | 0.393 |  |  |
| 6.454999999999564 | 0.394 |  |  |
| 6.449999999999564 | 0.394 |  |  |
| 6.444999999999565 | 0.394 |  |  |
| 6.439999999999565 | 0.394 |  |  |
| 6.434999999999565 | 0.394 |  |  |
| 6.429999999999565 | 0.394 |  |  |
| 6.424999999999565 | 0.395 |  |  |
| 6.419999999999565 | 0.395 |  |  |
| 6.414999999999565 | 0.395 |  |  |
| 6.409999999999565 | 0.395 |  |  |
| 6.404999999999565 | 0.395 |  |  |
| 6.399999999999565 | 0.395 |  |  |
| 6.394999999999566 | 0.395 |  |  |
| 6.389999999999566 | 0.396 |  |  |
| 6.384999999999566 | 0.396 |  |  |
| 6.379999999999566 | 0.396 |  |  |
| 6.374999999999566 | 0.396 |  |  |
| 6.369999999999566 | 0.396 |  |  |
| 6.364999999999567 | 0.396 |  |  |
| 6.359999999999566 | 0.397 |  |  |
| 6.354999999999567 | 0.397 |  |  |
| 6.349999999999567 | 0.397 |  |  |
| 6.344999999999567 | 0.397 |  |  |
| 6.339999999999567 | 0.397 |  |  |
| 6.334999999999567 | 0.397 |  |  |
| 6.329999999999567 | 0.397 |  |  |
| 6.324999999999568 | 0.398 |  |  |
| 6.319999999999567 | 0.398 |  |  |
| 6.314999999999568 | 0.398 |  |  |
| 6.309999999999567 | 0.398 |  |  |
| 6.304999999999568 | 0.398 |  |  |
| 6.299999999999568 | 0.398 |  |  |
| 6.294999999999568 | 0.399 |  |  |
| 6.289999999999568 | 0.399 |  |  |
| 6.284999999999568 | 0.399 |  |  |
| 6.279999999999568 | 0.399 |  |  |
| 6.274999999999568 | 0.399 |  |  |
| 6.269999999999568 | 0.399 |  |  |
| 6.264999999999569 | 0.4 |  |  |
| 6.259999999999568 | 0.4 |  |  |
| 6.25499999999957 | 0.4 |  |  |
| 6.24999999999957 | 0.4 |  |  |
| 6.24499999999957 | 0.4 |  |  |
| 6.23999999999957 | 0.4 |  |  |
| 6.23499999999957 | 0.4 |  |  |
| 6.22999999999957 | 0.401 |  |  |
| 6.22499999999957 | 0.401 |  |  |
| 6.21999999999957 | 0.401 |  |  |
| 6.21499999999957 | 0.401 |  |  |
| 6.20999999999957 | 0.401 |  |  |
| 6.20499999999957 | 0.401 |  |  |
| 6.19999999999957 | 0.402 |  |  |
| 6.19499999999957 | 0.402 |  |  |
| 6.18999999999957 | 0.402 |  |  |
| 6.184999999999571 | 0.402 |  |  |
| 6.17999999999957 | 0.402 |  |  |
| 6.174999999999571 | 0.402 |  |  |
| 6.169999999999571 | 0.403 |  |  |
| 6.164999999999571 | 0.403 |  |  |
| 6.159999999999571 | 0.403 |  |  |
| 6.154999999999571 | 0.403 |  |  |
| 6.149999999999571 | 0.403 |  |  |
| 6.144999999999571 | 0.403 |  |  |
| 6.139999999999571 | 0.404 |  |  |
| 6.134999999999572 | 0.404 |  |  |
| 6.129999999999572 | 0.404 |  |  |
| 6.124999999999572 | 0.404 |  |  |
| 6.119999999999572 | 0.404 |  |  |
| 6.114999999999572 | 0.404 |  |  |
| 6.109999999999572 | 0.405 |  |  |
| 6.104999999999572 | 0.405 |  |  |
| 6.099999999999572 | 0.405 |  |  |
| 6.094999999999573 | 0.405 |  |  |
| 6.089999999999572 | 0.405 |  |  |
| 6.084999999999573 | 0.405 |  |  |
| 6.079999999999572 | 0.406 |  |  |
| 6.074999999999573 | 0.406 |  |  |
| 6.069999999999573 | 0.406 |  |  |
| 6.064999999999573 | 0.406 |  |  |
| 6.059999999999573 | 0.406 |  |  |
| 6.054999999999573 | 0.406 |  |  |
| 6.049999999999573 | 0.407 |  |  |
| 6.044999999999574 | 0.407 |  |  |
| 6.039999999999573 | 0.407 |  |  |
| 6.034999999999574 | 0.407 |  |  |
| 6.029999999999574 | 0.407 |  |  |
| 6.024999999999574 | 0.407 |  |  |
| 6.019999999999574 | 0.408 |  |  |
| 6.014999999999574 | 0.408 |  |  |
| 6.009999999999574 | 0.408 |  |  |
| 6.004999999999574 | 0.408 |  |  |
| 5.999999999999574 | 0.408 |  |  |
| 5.994999999999574 | 0.408 |  |  |
| 5.989999999999574 | 0.409 |  |  |
| 5.984999999999574 | 0.409 |  |  |
| 5.979999999999574 | 0.409 |  |  |
| 5.974999999999575 | 0.409 |  |  |
| 5.969999999999575 | 0.409 |  |  |
| 5.964999999999575 | 0.409 |  |  |
| 5.959999999999575 | 0.41 |  |  |
| 5.954999999999575 | 0.41 |  |  |
| 5.949999999999575 | 0.41 |  |  |
| 5.944999999999575 | 0.41 |  |  |
| 5.939999999999575 | 0.41 |  |  |
| 5.934999999999575 | 0.41 |  |  |
| 5.929999999999576 | 0.411 |  |  |
| 5.924999999999576 | 0.411 |  |  |
| 5.919999999999576 | 0.411 |  |  |
| 5.914999999999576 | 0.411 |  |  |
| 5.909999999999576 | 0.411 |  |  |
| 5.904999999999576 | 0.412 |  |  |
| 5.899999999999576 | 0.412 |  |  |
| 5.894999999999577 | 0.412 |  |  |
| 5.889999999999576 | 0.412 |  |  |
| 5.884999999999577 | 0.412 |  |  |
| 5.879999999999577 | 0.412 |  |  |
| 5.874999999999577 | 0.413 |  |  |
| 5.869999999999577 | 0.413 |  |  |
| 5.864999999999577 | 0.413 |  |  |
| 5.859999999999577 | 0.413 |  |  |
| 5.854999999999578 | 0.413 |  |  |
| 5.849999999999577 | 0.413 |  |  |
| 5.844999999999578 | 0.414 |  |  |
| 5.839999999999577 | 0.414 |  |  |
| 5.834999999999578 | 0.414 |  |  |
| 5.829999999999578 | 0.414 |  |  |
| 5.824999999999578 | 0.414 |  |  |
| 5.819999999999578 | 0.415 |  |  |
| 5.814999999999578 | 0.415 |  |  |
| 5.809999999999578 | 0.415 |  |  |
| 5.804999999999579 | 0.415 |  |  |
| 5.799999999999578 | 0.415 |  |  |
| 5.794999999999579 | 0.415 |  |  |
| 5.789999999999578 | 0.416 |  |  |
| 5.78499999999958 | 0.416 |  |  |
| 5.77999999999958 | 0.416 |  |  |
| 5.77499999999958 | 0.416 |  |  |
| 5.76999999999958 | 0.416 |  |  |
| 5.764999999999579 | 0.416 |  |  |
| 5.75999999999958 | 0.417 |  |  |
| 5.75499999999958 | 0.417 |  |  |
| 5.74999999999958 | 0.417 |  |  |
| 5.74499999999958 | 0.417 |  |  |
| 5.73999999999958 | 0.417 |  |  |
| 5.73499999999958 | 0.418 |  |  |
| 5.72999999999958 | 0.418 |  |  |
| 5.72499999999958 | 0.418 |  |  |
| 5.71999999999958 | 0.418 |  |  |
| 5.714999999999581 | 0.418 |  |  |
| 5.70999999999958 | 0.418 |  |  |
| 5.704999999999581 | 0.419 |  |  |
| 5.699999999999581 | 0.419 |  |  |
| 5.694999999999581 | 0.419 |  |  |
| 5.689999999999581 | 0.419 |  |  |
| 5.684999999999581 | 0.419 |  |  |
| 5.679999999999581 | 0.42 |  |  |
| 5.674999999999581 | 0.42 |  |  |
| 5.669999999999581 | 0.42 |  |  |
| 5.664999999999582 | 0.42 |  |  |
| 5.659999999999582 | 0.42 |  |  |
| 5.654999999999582 | 0.421 |  |  |
| 5.649999999999582 | 0.421 |  |  |
| 5.644999999999582 | 0.421 |  |  |
| 5.639999999999582 | 0.421 |  |  |
| 5.634999999999582 | 0.421 |  |  |
| 5.629999999999582 | 0.421 |  |  |
| 5.624999999999582 | 0.422 |  |  |
| 5.619999999999583 | 0.422 |  |  |
| 5.614999999999583 | 0.422 |  |  |
| 5.609999999999583 | 0.422 |  |  |
| 5.604999999999583 | 0.422 |  |  |
| 5.599999999999583 | 0.423 |  |  |
| 5.594999999999583 | 0.423 |  |  |
| 5.589999999999583 | 0.423 |  |  |
| 5.584999999999583 | 0.423 |  |  |
| 5.579999999999583 | 0.423 |  |  |
| 5.574999999999584 | 0.424 |  |  |
| 5.569999999999584 | 0.424 |  |  |
| 5.564999999999584 | 0.424 |  |  |
| 5.559999999999584 | 0.424 |  |  |
| 5.554999999999584 | 0.424 |  |  |
| 5.549999999999584 | 0.424 |  |  |
| 5.544999999999584 | 0.425 |  |  |
| 5.539999999999584 | 0.425 |  |  |
| 5.534999999999584 | 0.425 |  |  |
| 5.529999999999584 | 0.425 |  |  |
| 5.524999999999585 | 0.425 |  |  |
| 5.519999999999584 | 0.426 |  |  |
| 5.514999999999585 | 0.426 |  |  |
| 5.509999999999585 | 0.426 |  |  |
| 5.504999999999585 | 0.426 |  |  |
| 5.499999999999585 | 0.426 |  |  |
| 5.494999999999585 | 0.427 |  |  |
| 5.489999999999585 | 0.427 |  |  |
| 5.484999999999585 | 0.427 |  |  |
| 5.479999999999585 | 0.427 |  |  |
| 5.474999999999585 | 0.427 |  |  |
| 5.469999999999585 | 0.428 |  |  |
| 5.464999999999586 | 0.428 |  |  |
| 5.459999999999586 | 0.428 |  |  |
| 5.454999999999586 | 0.428 |  |  |
| 5.449999999999586 | 0.428 |  |  |
| 5.444999999999586 | 0.429 |  |  |
| 5.439999999999586 | 0.429 |  |  |
| 5.434999999999586 | 0.429 |  |  |
| 5.429999999999586 | 0.429 |  |  |
| 5.424999999999587 | 0.429 |  |  |
| 5.419999999999586 | 0.43 |  |  |
| 5.414999999999587 | 0.43 |  |  |
| 5.409999999999587 | 0.43 |  |  |
| 5.404999999999587 | 0.43 |  |  |
| 5.399999999999587 | 0.43 |  |  |
| 5.394999999999587 | 0.431 |  |  |
| 5.389999999999587 | 0.431 |  |  |
| 5.384999999999588 | 0.431 |  |  |
| 5.379999999999587 | 0.431 |  |  |
| 5.374999999999588 | 0.431 |  |  |
| 5.369999999999588 | 0.432 |  |  |
| 5.364999999999588 | 0.432 |  |  |
| 5.359999999999588 | 0.432 |  |  |
| 5.354999999999588 | 0.432 |  |  |
| 5.349999999999588 | 0.432 |  |  |
| 5.344999999999588 | 0.433 |  |  |
| 5.339999999999588 | 0.433 |  |  |
| 5.334999999999589 | 0.433 |  |  |
| 5.329999999999589 | 0.433 |  |  |
| 5.324999999999589 | 0.433 |  |  |
| 5.31999999999959 | 0.434 |  |  |
| 5.314999999999589 | 0.434 |  |  |
| 5.30999999999959 | 0.434 |  |  |
| 5.304999999999589 | 0.434 |  |  |
| 5.29999999999959 | 0.434 |  |  |
| 5.29499999999959 | 0.435 |  |  |
| 5.28999999999959 | 0.435 |  |  |
| 5.28499999999959 | 0.435 |  |  |
| 5.27999999999959 | 0.435 |  |  |
| 5.27499999999959 | 0.435 |  |  |
| 5.26999999999959 | 0.436 |  |  |
| 5.26499999999959 | 0.436 |  |  |
| 5.25999999999959 | 0.436 |  |  |
| 5.25499999999959 | 0.436 |  |  |
| 5.24999999999959 | 0.436 |  |  |
| 5.244999999999591 | 0.437 |  |  |
| 5.23999999999959 | 0.437 |  |  |
| 5.234999999999591 | 0.437 |  |  |
| 5.229999999999591 | 0.437 |  |  |
| 5.224999999999591 | 0.437 |  |  |
| 5.219999999999591 | 0.438 |  |  |
| 5.214999999999591 | 0.438 |  |  |
| 5.209999999999591 | 0.438 |  |  |
| 5.204999999999591 | 0.438 |  |  |
| 5.199999999999592 | 0.439 |  |  |
| 5.194999999999592 | 0.439 |  |  |
| 5.189999999999592 | 0.439 |  |  |
| 5.184999999999592 | 0.439 |  |  |
| 5.179999999999592 | 0.439 |  |  |
| 5.174999999999592 | 0.44 |  |  |
| 5.169999999999592 | 0.44 |  |  |
| 5.164999999999592 | 0.44 |  |  |
| 5.159999999999592 | 0.44 |  |  |
| 5.154999999999593 | 0.44 |  |  |
| 5.149999999999593 | 0.441 |  |  |
| 5.144999999999593 | 0.441 |  |  |
| 5.139999999999593 | 0.441 |  |  |
| 5.134999999999593 | 0.441 |  |  |
| 5.129999999999593 | 0.442 |  |  |
| 5.124999999999593 | 0.442 |  |  |
| 5.119999999999593 | 0.442 |  |  |
| 5.114999999999593 | 0.442 |  |  |
| 5.109999999999594 | 0.442 |  |  |
| 5.104999999999594 | 0.443 |  |  |
| 5.099999999999594 | 0.443 |  |  |
| 5.094999999999594 | 0.443 |  |  |
| 5.089999999999594 | 0.443 |  |  |
| 5.084999999999594 | 0.443 |  |  |
| 5.079999999999594 | 0.444 |  |  |
| 5.074999999999594 | 0.444 |  |  |
| 5.069999999999594 | 0.444 |  |  |
| 5.064999999999594 | 0.444 |  |  |
| 5.059999999999594 | 0.445 |  |  |
| 5.054999999999595 | 0.445 |  |  |
| 5.049999999999594 | 0.445 |  |  |
| 5.044999999999595 | 0.445 |  |  |
| 5.039999999999595 | 0.445 |  |  |
| 5.034999999999595 | 0.446 |  |  |
| 5.029999999999595 | 0.446 |  |  |
| 5.024999999999595 | 0.446 |  |  |
| 5.019999999999595 | 0.446 |  |  |
| 5.014999999999596 | 0.447 |  |  |
| 5.009999999999595 | 0.447 |  |  |
| 5.004999999999596 | 0.447 |  |  |
| 4.999999999999595 | 0.447 |  |  |
| 4.994999999999596 | 0.447 |  |  |
| 4.989999999999596 | 0.448 |  |  |
| 4.984999999999596 | 0.448 |  |  |
| 4.979999999999596 | 0.448 |  |  |
| 4.974999999999596 | 0.448 |  |  |
| 4.969999999999596 | 0.449 |  |  |
| 4.964999999999597 | 0.449 |  |  |
| 4.959999999999596 | 0.449 |  |  |
| 4.954999999999597 | 0.449 |  |  |
| 4.949999999999596 | 0.449 |  |  |
| 4.944999999999597 | 0.45 |  |  |
| 4.939999999999597 | 0.45 |  |  |
| 4.934999999999597 | 0.45 |  |  |
| 4.929999999999597 | 0.45 |  |  |
| 4.924999999999597 | 0.451 |  |  |
| 4.919999999999597 | 0.451 |  |  |
| 4.914999999999598 | 0.451 |  |  |
| 4.909999999999597 | 0.451 |  |  |
| 4.904999999999598 | 0.452 |  |  |
| 4.899999999999598 | 0.452 |  |  |
| 4.894999999999598 | 0.452 |  |  |
| 4.889999999999598 | 0.452 |  |  |
| 4.884999999999598 | 0.452 |  |  |
| 4.879999999999598 | 0.453 |  |  |
| 4.874999999999598 | 0.453 |  |  |
| 4.869999999999599 | 0.453 |  |  |
| 4.864999999999599 | 0.453 |  |  |
| 4.859999999999599 | 0.454 |  |  |
| 4.854999999999599 | 0.454 |  |  |
| 4.8499999999996 | 0.454 |  |  |
| 4.844999999999599 | 0.454 |  |  |
| 4.8399999999996 | 0.455 |  |  |
| 4.834999999999599 | 0.455 |  |  |
| 4.829999999999599 | 0.455 |  |  |
| 4.8249999999996 | 0.455 |  |  |
| 4.8199999999996 | 0.455 |  |  |
| 4.8149999999996 | 0.456 |  |  |
| 4.8099999999996 | 0.456 |  |  |
| 4.8049999999996 | 0.456 |  |  |
| 4.7999999999996 | 0.456 |  |  |
| 4.7949999999996 | 0.457 |  |  |
| 4.7899999999996 | 0.457 |  |  |
| 4.7849999999996 | 0.457 |  |  |
| 4.7799999999996 | 0.457 |  |  |
| 4.7749999999996 | 0.458 |  |  |
| 4.7699999999996 | 0.458 |  |  |
| 4.764999999999601 | 0.458 |  |  |
| 4.7599999999996 | 0.458 |  |  |
| 4.754999999999601 | 0.459 |  |  |
| 4.7499999999996 | 0.459 |  |  |
| 4.744999999999601 | 0.459 |  |  |
| 4.7399999999996 | 0.459 |  |  |
| 4.734999999999601 | 0.46 |  |  |
| 4.729999999999601 | 0.46 |  |  |
| 4.724999999999602 | 0.46 |  |  |
| 4.719999999999601 | 0.46 |  |  |
| 4.714999999999602 | 0.461 |  |  |
| 4.709999999999601 | 0.461 |  |  |
| 4.704999999999602 | 0.461 |  |  |
| 4.699999999999602 | 0.461 |  |  |
| 4.694999999999602 | 0.462 |  |  |
| 4.689999999999602 | 0.462 |  |  |
| 4.684999999999602 | 0.462 |  |  |
| 4.679999999999602 | 0.462 |  |  |
| 4.674999999999603 | 0.462 |  |  |
| 4.669999999999603 | 0.463 |  |  |
| 4.664999999999603 | 0.463 |  |  |
| 4.659999999999603 | 0.463 |  |  |
| 4.654999999999603 | 0.463 |  |  |
| 4.649999999999603 | 0.464 |  |  |
| 4.644999999999603 | 0.464 |  |  |
| 4.639999999999603 | 0.464 |  |  |
| 4.634999999999604 | 0.464 |  |  |
| 4.629999999999604 | 0.465 |  |  |
| 4.624999999999604 | 0.465 |  |  |
| 4.619999999999604 | 0.465 |  |  |
| 4.614999999999604 | 0.465 |  |  |
| 4.609999999999604 | 0.466 |  |  |
| 4.604999999999604 | 0.466 |  |  |
| 4.599999999999604 | 0.466 |  |  |
| 4.594999999999604 | 0.467 |  |  |
| 4.589999999999604 | 0.467 |  |  |
| 4.584999999999604 | 0.467 |  |  |
| 4.579999999999604 | 0.467 |  |  |
| 4.574999999999604 | 0.468 |  |  |
| 4.569999999999605 | 0.468 |  |  |
| 4.564999999999605 | 0.468 |  |  |
| 4.559999999999605 | 0.468 |  |  |
| 4.554999999999605 | 0.469 |  |  |
| 4.549999999999605 | 0.469 |  |  |
| 4.544999999999605 | 0.469 |  |  |
| 4.539999999999605 | 0.469 |  |  |
| 4.534999999999605 | 0.47 |  |  |
| 4.529999999999605 | 0.47 |  |  |
| 4.524999999999606 | 0.47 |  |  |
| 4.519999999999606 | 0.47 |  |  |
| 4.514999999999606 | 0.471 |  |  |
| 4.509999999999606 | 0.471 |  |  |
| 4.504999999999606 | 0.471 |  |  |
| 4.499999999999606 | 0.471 |  |  |
| 4.494999999999606 | 0.472 |  |  |
| 4.489999999999606 | 0.472 |  |  |
| 4.484999999999606 | 0.472 |  |  |
| 4.479999999999606 | 0.472 |  |  |
| 4.474999999999607 | 0.473 |  |  |
| 4.469999999999607 | 0.473 |  |  |
| 4.464999999999607 | 0.473 |  |  |
| 4.459999999999607 | 0.474 |  |  |
| 4.454999999999607 | 0.474 |  |  |
| 4.449999999999607 | 0.474 |  |  |
| 4.444999999999607 | 0.474 |  |  |
| 4.439999999999607 | 0.475 |  |  |
| 4.434999999999607 | 0.475 |  |  |
| 4.429999999999607 | 0.475 |  |  |
| 4.424999999999608 | 0.475 |  |  |
| 4.419999999999608 | 0.476 |  |  |
| 4.414999999999608 | 0.476 |  |  |
| 4.409999999999608 | 0.476 |  |  |
| 4.404999999999608 | 0.476 |  |  |
| 4.399999999999608 | 0.477 |  |  |
| 4.394999999999609 | 0.477 |  |  |
| 4.389999999999608 | 0.477 |  |  |
| 4.384999999999609 | 0.478 |  |  |
| 4.37999999999961 | 0.478 |  |  |
| 4.37499999999961 | 0.478 |  |  |
| 4.36999999999961 | 0.478 |  |  |
| 4.364999999999609 | 0.479 |  |  |
| 4.35999999999961 | 0.479 |  |  |
| 4.35499999999961 | 0.479 |  |  |
| 4.34999999999961 | 0.479 |  |  |
| 4.34499999999961 | 0.48 |  |  |
| 4.33999999999961 | 0.48 |  |  |
| 4.33499999999961 | 0.48 |  |  |
| 4.32999999999961 | 0.481 |  |  |
| 4.32499999999961 | 0.481 |  |  |
| 4.31999999999961 | 0.481 |  |  |
| 4.31499999999961 | 0.481 |  |  |
| 4.30999999999961 | 0.482 |  |  |
| 4.304999999999611 | 0.482 |  |  |
| 4.29999999999961 | 0.482 |  |  |
| 4.294999999999611 | 0.483 |  |  |
| 4.28999999999961 | 0.483 |  |  |
| 4.284999999999611 | 0.483 |  |  |
| 4.27999999999961 | 0.483 |  |  |
| 4.274999999999611 | 0.484 |  |  |
| 4.269999999999611 | 0.484 |  |  |
| 4.264999999999612 | 0.484 |  |  |
| 4.259999999999611 | 0.485 |  |  |
| 4.254999999999612 | 0.485 |  |  |
| 4.249999999999611 | 0.485 |  |  |
| 4.244999999999612 | 0.485 |  |  |
| 4.239999999999612 | 0.486 |  |  |
| 4.234999999999612 | 0.486 |  |  |
| 4.229999999999612 | 0.486 |  |  |
| 4.224999999999612 | 0.487 |  |  |
| 4.219999999999612 | 0.487 |  |  |
| 4.214999999999613 | 0.487 |  |  |
| 4.209999999999612 | 0.487 |  |  |
| 4.204999999999613 | 0.488 |  |  |
| 4.199999999999613 | 0.488 |  |  |
| 4.194999999999613 | 0.488 |  |  |
| 4.189999999999613 | 0.489 |  |  |
| 4.184999999999613 | 0.489 |  |  |
| 4.179999999999613 | 0.489 |  |  |
| 4.174999999999613 | 0.489 |  |  |
| 4.169999999999614 | 0.49 |  |  |
| 4.164999999999614 | 0.49 |  |  |
| 4.159999999999614 | 0.49 |  |  |
| 4.154999999999614 | 0.491 |  |  |
| 4.149999999999614 | 0.491 |  |  |
| 4.144999999999614 | 0.491 |  |  |
| 4.139999999999614 | 0.491 |  |  |
| 4.134999999999614 | 0.492 |  |  |
| 4.129999999999614 | 0.492 |  |  |
| 4.124999999999615 | 0.492 |  |  |
| 4.119999999999614 | 0.493 |  |  |
| 4.114999999999615 | 0.493 |  |  |
| 4.109999999999614 | 0.493 |  |  |
| 4.104999999999615 | 0.494 |  |  |
| 4.099999999999615 | 0.494 |  |  |
| 4.094999999999615 | 0.494 |  |  |
| 4.089999999999615 | 0.494 |  |  |
| 4.084999999999615 | 0.495 |  |  |
| 4.079999999999615 | 0.495 |  |  |
| 4.074999999999615 | 0.495 |  |  |
| 4.069999999999615 | 0.496 |  |  |
| 4.064999999999616 | 0.496 |  |  |
| 4.059999999999615 | 0.496 |  |  |
| 4.054999999999616 | 0.497 |  |  |
| 4.049999999999616 | 0.497 |  |  |
| 4.044999999999616 | 0.497 |  |  |
| 4.039999999999616 | 0.498 |  |  |
| 4.034999999999616 | 0.498 |  |  |
| 4.029999999999616 | 0.498 |  |  |
| 4.024999999999617 | 0.498 |  |  |
| 4.019999999999616 | 0.499 |  |  |
| 4.014999999999617 | 0.499 |  |  |
| 4.009999999999616 | 0.499 |  |  |
| 4.004999999999617 | 0.5 |  |  |
| 3.999999999999617 | 0.5 |  |  |
| 3.994999999999617 | 0.5 |  |  |
| 3.989999999999617 | 0.501 |  |  |
| 3.984999999999617 | 0.501 |  |  |
| 3.979999999999618 | 0.501 |  |  |
| 3.974999999999618 | 0.502 |  |  |
| 3.969999999999618 | 0.502 |  |  |
| 3.964999999999618 | 0.502 |  |  |
| 3.959999999999618 | 0.503 |  |  |
| 3.954999999999618 | 0.503 |  |  |
| 3.949999999999618 | 0.503 |  |  |
| 3.944999999999618 | 0.503 |  |  |
| 3.939999999999618 | 0.504 |  |  |
| 3.934999999999619 | 0.504 |  |  |
| 3.929999999999619 | 0.504 |  |  |
| 3.924999999999619 | 0.505 |  |  |
| 3.919999999999619 | 0.505 |  |  |
| 3.914999999999619 | 0.505 |  |  |
| 3.909999999999619 | 0.506 |  |  |
| 3.904999999999619 | 0.506 |  |  |
| 3.899999999999619 | 0.506 |  |  |
| 3.894999999999619 | 0.507 |  |  |
| 3.889999999999619 | 0.507 |  |  |
| 3.88499999999962 | 0.507 |  |  |
| 3.87999999999962 | 0.508 |  |  |
| 3.87499999999962 | 0.508 |  |  |
| 3.86999999999962 | 0.508 |  |  |
| 3.86499999999962 | 0.509 |  |  |
| 3.85999999999962 | 0.509 |  |  |
| 3.85499999999962 | 0.509 |  |  |
| 3.84999999999962 | 0.51 |  |  |
| 3.84499999999962 | 0.51 |  |  |
| 3.839999999999621 | 0.51 |  |  |
| 3.834999999999621 | 0.511 |  |  |
| 3.829999999999621 | 0.511 |  |  |
| 3.824999999999621 | 0.511 |  |  |
| 3.819999999999621 | 0.512 |  |  |
| 3.814999999999621 | 0.512 |  |  |
| 3.809999999999621 | 0.512 |  |  |
| 3.804999999999621 | 0.513 |  |  |
| 3.799999999999621 | 0.513 |  |  |
| 3.794999999999621 | 0.513 |  |  |
| 3.789999999999622 | 0.514 |  |  |
| 3.784999999999622 | 0.514 |  |  |
| 3.779999999999622 | 0.514 |  |  |
| 3.774999999999622 | 0.515 |  |  |
| 3.769999999999622 | 0.515 |  |  |
| 3.764999999999622 | 0.515 |  |  |
| 3.759999999999622 | 0.516 |  |  |
| 3.754999999999622 | 0.516 |  |  |
| 3.749999999999622 | 0.516 |  |  |
| 3.744999999999623 | 0.517 |  |  |
| 3.739999999999623 | 0.517 |  |  |
| 3.734999999999623 | 0.517 |  |  |
| 3.729999999999623 | 0.518 |  |  |
| 3.724999999999623 | 0.518 |  |  |
| 3.719999999999623 | 0.518 |  |  |
| 3.714999999999623 | 0.519 |  |  |
| 3.709999999999623 | 0.519 |  |  |
| 3.704999999999623 | 0.52 |  |  |
| 3.699999999999623 | 0.52 |  |  |
| 3.694999999999624 | 0.52 |  |  |
| 3.689999999999624 | 0.521 |  |  |
| 3.684999999999624 | 0.521 |  |  |
| 3.679999999999624 | 0.521 |  |  |
| 3.674999999999624 | 0.522 |  |  |
| 3.669999999999624 | 0.522 |  |  |
| 3.664999999999624 | 0.522 |  |  |
| 3.659999999999624 | 0.523 |  |  |
| 3.654999999999624 | 0.523 |  |  |
| 3.649999999999625 | 0.523 |  |  |
| 3.644999999999625 | 0.524 |  |  |
| 3.639999999999625 | 0.524 |  |  |
| 3.634999999999625 | 0.525 |  |  |
| 3.629999999999625 | 0.525 |  |  |
| 3.624999999999625 | 0.525 |  |  |
| 3.619999999999625 | 0.526 |  |  |
| 3.614999999999625 | 0.526 |  |  |
| 3.609999999999625 | 0.526 |  |  |
| 3.604999999999626 | 0.527 |  |  |
| 3.599999999999626 | 0.527 |  |  |
| 3.594999999999626 | 0.527 |  |  |
| 3.589999999999626 | 0.528 |  |  |
| 3.584999999999626 | 0.528 |  |  |
| 3.579999999999626 | 0.529 |  |  |
| 3.574999999999626 | 0.529 |  |  |
| 3.569999999999626 | 0.529 |  |  |
| 3.564999999999626 | 0.53 |  |  |
| 3.559999999999627 | 0.53 |  |  |
| 3.554999999999627 | 0.53 |  |  |
| 3.549999999999627 | 0.531 |  |  |
| 3.544999999999627 | 0.531 |  |  |
| 3.539999999999627 | 0.531 |  |  |
| 3.534999999999627 | 0.532 |  |  |
| 3.529999999999627 | 0.532 |  |  |
| 3.524999999999627 | 0.533 |  |  |
| 3.519999999999627 | 0.533 |  |  |
| 3.514999999999628 | 0.533 |  |  |
| 3.509999999999628 | 0.534 |  |  |
| 3.504999999999628 | 0.534 |  |  |
| 3.499999999999628 | 0.535 |  |  |
| 3.494999999999628 | 0.535 |  |  |
| 3.489999999999628 | 0.535 |  |  |
| 3.484999999999628 | 0.536 |  |  |
| 3.479999999999628 | 0.536 |  |  |
| 3.474999999999628 | 0.536 |  |  |
| 3.469999999999628 | 0.537 |  |  |
| 3.464999999999629 | 0.537 |  |  |
| 3.459999999999629 | 0.538 |  |  |
| 3.454999999999629 | 0.538 |  |  |
| 3.449999999999629 | 0.538 |  |  |
| 3.444999999999629 | 0.539 |  |  |
| 3.439999999999629 | 0.539 |  |  |
| 3.434999999999629 | 0.54 |  |  |
| 3.429999999999629 | 0.54 |  |  |
| 3.424999999999629 | 0.54 |  |  |
| 3.41999999999963 | 0.541 |  |  |
| 3.41499999999963 | 0.541 |  |  |
| 3.40999999999963 | 0.542 |  |  |
| 3.40499999999963 | 0.542 |  |  |
| 3.39999999999963 | 0.542 |  |  |
| 3.39499999999963 | 0.543 |  |  |
| 3.38999999999963 | 0.543 |  |  |
| 3.38499999999963 | 0.544 |  |  |
| 3.37999999999963 | 0.544 |  |  |
| 3.37499999999963 | 0.544 |  |  |
| 3.369999999999631 | 0.545 |  |  |
| 3.364999999999631 | 0.545 |  |  |
| 3.359999999999631 | 0.546 |  |  |
| 3.354999999999631 | 0.546 |  |  |
| 3.349999999999631 | 0.546 |  |  |
| 3.344999999999631 | 0.547 |  |  |
| 3.339999999999631 | 0.547 |  |  |
| 3.334999999999631 | 0.548 |  |  |
| 3.329999999999631 | 0.548 |  |  |
| 3.324999999999632 | 0.548 |  |  |
| 3.319999999999632 | 0.549 |  |  |
| 3.314999999999632 | 0.549 |  |  |
| 3.309999999999632 | 0.55 |  |  |
| 3.304999999999632 | 0.55 |  |  |
| 3.299999999999632 | 0.55 |  |  |
| 3.294999999999632 | 0.551 |  |  |
| 3.289999999999632 | 0.551 |  |  |
| 3.284999999999632 | 0.552 |  |  |
| 3.279999999999633 | 0.552 |  |  |
| 3.274999999999633 | 0.553 |  |  |
| 3.269999999999633 | 0.553 |  |  |
| 3.264999999999633 | 0.553 |  |  |
| 3.259999999999633 | 0.554 |  |  |
| 3.254999999999633 | 0.554 |  |  |
| 3.249999999999633 | 0.555 |  |  |
| 3.244999999999633 | 0.555 |  |  |
| 3.239999999999633 | 0.556 |  |  |
| 3.234999999999633 | 0.556 |  |  |
| 3.229999999999634 | 0.556 |  |  |
| 3.224999999999634 | 0.557 |  |  |
| 3.219999999999634 | 0.557 |  |  |
| 3.214999999999634 | 0.558 |  |  |
| 3.209999999999634 | 0.558 |  |  |
| 3.204999999999634 | 0.559 |  |  |
| 3.199999999999634 | 0.559 |  |  |
| 3.194999999999634 | 0.559 |  |  |
| 3.189999999999634 | 0.56 |  |  |
| 3.184999999999635 | 0.56 |  |  |
| 3.179999999999635 | 0.561 |  |  |
| 3.174999999999635 | 0.561 |  |  |
| 3.169999999999635 | 0.562 |  |  |
| 3.164999999999635 | 0.562 |  |  |
| 3.159999999999635 | 0.563 |  |  |
| 3.154999999999635 | 0.563 |  |  |
| 3.149999999999635 | 0.563 |  |  |
| 3.144999999999635 | 0.564 |  |  |
| 3.139999999999636 | 0.564 |  |  |
| 3.134999999999636 | 0.565 |  |  |
| 3.129999999999636 | 0.565 |  |  |
| 3.124999999999636 | 0.566 |  |  |
| 3.119999999999636 | 0.566 |  |  |
| 3.114999999999636 | 0.567 |  |  |
| 3.109999999999636 | 0.567 |  |  |
| 3.104999999999636 | 0.568 |  |  |
| 3.099999999999636 | 0.568 |  |  |
| 3.094999999999636 | 0.568 |  |  |
| 3.089999999999637 | 0.569 |  |  |
| 3.084999999999637 | 0.569 |  |  |
| 3.079999999999637 | 0.57 |  |  |
| 3.074999999999637 | 0.57 |  |  |
| 3.069999999999637 | 0.571 |  |  |
| 3.064999999999637 | 0.571 |  |  |
| 3.059999999999637 | 0.572 |  |  |
| 3.054999999999637 | 0.572 |  |  |
| 3.049999999999637 | 0.573 |  |  |
| 3.044999999999638 | 0.573 |  |  |
| 3.039999999999638 | 0.574 |  |  |
| 3.034999999999638 | 0.574 |  |  |
| 3.029999999999638 | 0.574 |  |  |
| 3.024999999999638 | 0.575 |  |  |
| 3.019999999999638 | 0.575 |  |  |
| 3.014999999999638 | 0.576 |  |  |
| 3.009999999999638 | 0.576 |  |  |
| 3.004999999999638 | 0.577 |  |  |
| 2.999999999999638 | 0.577 |  |  |
| 2.994999999999639 | 0.578 |  |  |
| 2.989999999999639 | 0.578 |  |  |
| 2.984999999999639 | 0.579 |  |  |
| 2.979999999999639 | 0.579 |  |  |
| 2.974999999999639 | 0.58 |  |  |
| 2.969999999999639 | 0.58 |  |  |
| 2.964999999999639 | 0.581 |  |  |
| 2.959999999999639 | 0.581 |  |  |
| 2.954999999999639 | 0.582 |  |  |
| 2.94999999999964 | 0.582 |  |  |
| 2.94499999999964 | 0.583 |  |  |
| 2.93999999999964 | 0.583 |  |  |
| 2.93499999999964 | 0.584 |  |  |
| 2.92999999999964 | 0.584 |  |  |
| 2.92499999999964 | 0.585 |  |  |
| 2.91999999999964 | 0.585 |  |  |
| 2.91499999999964 | 0.586 |  |  |
| 2.90999999999964 | 0.586 |  |  |
| 2.904999999999641 | 0.587 |  |  |
| 2.899999999999641 | 0.587 |  |  |
| 2.894999999999641 | 0.588 |  |  |
| 2.889999999999641 | 0.588 |  |  |
| 2.884999999999641 | 0.589 |  |  |
| 2.879999999999641 | 0.589 |  |  |
| 2.874999999999641 | 0.59 |  |  |
| 2.869999999999641 | 0.59 |  |  |
| 2.864999999999641 | 0.591 |  |  |
| 2.859999999999641 | 0.591 |  |  |
| 2.854999999999642 | 0.592 |  |  |
| 2.849999999999642 | 0.592 |  |  |
| 2.844999999999642 | 0.593 |  |  |
| 2.839999999999642 | 0.593 |  |  |
| 2.834999999999642 | 0.594 |  |  |
| 2.829999999999642 | 0.594 |  |  |
| 2.824999999999642 | 0.595 |  |  |
| 2.819999999999642 | 0.595 |  |  |
| 2.814999999999642 | 0.596 |  |  |
| 2.809999999999643 | 0.597 |  |  |
| 2.804999999999643 | 0.597 |  |  |
| 2.799999999999643 | 0.598 |  |  |
| 2.794999999999643 | 0.598 |  |  |
| 2.789999999999643 | 0.599 |  |  |
| 2.784999999999643 | 0.599 |  |  |
| 2.779999999999643 | 0.6 |  |  |
| 2.774999999999643 | 0.6 |  |  |
| 2.769999999999643 | 0.601 |  |  |
| 2.764999999999643 | 0.601 |  |  |
| 2.759999999999644 | 0.602 |  |  |
| 2.754999999999644 | 0.602 |  |  |
| 2.749999999999644 | 0.603 |  |  |
| 2.744999999999644 | 0.604 |  |  |
| 2.739999999999644 | 0.604 |  |  |
| 2.734999999999644 | 0.605 |  |  |
| 2.729999999999644 | 0.605 |  |  |
| 2.724999999999644 | 0.606 |  |  |
| 2.719999999999644 | 0.606 |  |  |
| 2.714999999999645 | 0.607 |  |  |
| 2.709999999999645 | 0.607 |  |  |
| 2.704999999999645 | 0.608 |  |  |
| 2.699999999999645 | 0.609 |  |  |
| 2.694999999999645 | 0.609 |  |  |
| 2.689999999999645 | 0.61 |  |  |
| 2.684999999999645 | 0.61 |  |  |
| 2.679999999999645 | 0.611 |  |  |
| 2.674999999999645 | 0.611 |  |  |
| 2.669999999999645 | 0.612 |  |  |
| 2.664999999999646 | 0.613 |  |  |
| 2.659999999999646 | 0.613 |  |  |
| 2.654999999999646 | 0.614 |  |  |
| 2.649999999999646 | 0.614 |  |  |
| 2.644999999999646 | 0.615 |  |  |
| 2.639999999999646 | 0.615 |  |  |
| 2.634999999999646 | 0.616 |  |  |
| 2.629999999999646 | 0.617 |  |  |
| 2.624999999999646 | 0.617 |  |  |
| 2.619999999999647 | 0.618 |  |  |
| 2.614999999999647 | 0.618 |  |  |
| 2.609999999999647 | 0.619 |  |  |
| 2.604999999999647 | 0.62 |  |  |
| 2.599999999999647 | 0.62 |  |  |
| 2.594999999999647 | 0.621 |  |  |
| 2.589999999999647 | 0.621 |  |  |
| 2.584999999999647 | 0.622 |  |  |
| 2.579999999999647 | 0.623 |  |  |
| 2.574999999999648 | 0.623 |  |  |
| 2.569999999999648 | 0.624 |  |  |
| 2.564999999999648 | 0.624 |  |  |
| 2.559999999999648 | 0.625 |  |  |
| 2.554999999999648 | 0.626 |  |  |
| 2.549999999999648 | 0.626 |  |  |
| 2.544999999999648 | 0.627 |  |  |
| 2.539999999999648 | 0.627 |  |  |
| 2.534999999999648 | 0.628 |  |  |
| 2.529999999999649 | 0.629 |  |  |
| 2.524999999999649 | 0.629 |  |  |
| 2.519999999999649 | 0.63 |  |  |
| 2.514999999999649 | 0.631 |  |  |
| 2.509999999999649 | 0.631 |  |  |
| 2.504999999999649 | 0.632 |  |  |
| 2.499999999999649 | 0.632 |  |  |
| 2.494999999999649 | 0.633 |  |  |
| 2.489999999999649 | 0.634 |  |  |
| 2.484999999999649 | 0.634 |  |  |
| 2.47999999999965 | 0.635 |  |  |
| 2.47499999999965 | 0.636 |  |  |
| 2.46999999999965 | 0.636 |  |  |
| 2.46499999999965 | 0.637 |  |  |
| 2.45999999999965 | 0.638 |  |  |
| 2.45499999999965 | 0.638 |  |  |
| 2.44999999999965 | 0.639 |  |  |
| 2.44499999999965 | 0.64 |  |  |
| 2.43999999999965 | 0.64 |  |  |
| 2.434999999999651 | 0.641 |  |  |
| 2.429999999999651 | 0.642 |  |  |
| 2.424999999999651 | 0.642 |  |  |
| 2.419999999999651 | 0.643 |  |  |
| 2.414999999999651 | 0.643 |  |  |
| 2.409999999999651 | 0.644 |  |  |
| 2.404999999999651 | 0.645 |  |  |
| 2.399999999999651 | 0.645 |  |  |
| 2.394999999999651 | 0.646 |  |  |
| 2.389999999999651 | 0.647 |  |  |
| 2.384999999999652 | 0.648 |  |  |
| 2.379999999999652 | 0.648 |  |  |
| 2.374999999999652 | 0.649 |  |  |
| 2.369999999999652 | 0.65 |  |  |
| 2.364999999999652 | 0.65 |  |  |
| 2.359999999999652 | 0.651 |  |  |
| 2.354999999999652 | 0.652 |  |  |
| 2.349999999999652 | 0.652 |  |  |
| 2.344999999999652 | 0.653 |  |  |
| 2.339999999999653 | 0.654 |  |  |
| 2.334999999999653 | 0.654 |  |  |
| 2.329999999999653 | 0.655 |  |  |
| 2.324999999999653 | 0.656 |  |  |
| 2.319999999999653 | 0.657 |  |  |
| 2.314999999999653 | 0.657 |  |  |
| 2.309999999999653 | 0.658 |  |  |
| 2.304999999999653 | 0.659 |  |  |
| 2.299999999999653 | 0.659 |  |  |
| 2.294999999999654 | 0.66 |  |  |
| 2.289999999999654 | 0.661 |  |  |
| 2.284999999999654 | 0.662 |  |  |
| 2.279999999999654 | 0.662 |  |  |
| 2.274999999999654 | 0.663 |  |  |
| 2.269999999999654 | 0.664 |  |  |
| 2.264999999999654 | 0.664 |  |  |
| 2.259999999999654 | 0.665 |  |  |
| 2.254999999999654 | 0.666 |  |  |
| 2.249999999999654 | 0.667 |  |  |
| 2.244999999999655 | 0.667 |  |  |
| 2.239999999999655 | 0.668 |  |  |
| 2.234999999999655 | 0.669 |  |  |
| 2.229999999999655 | 0.67 |  |  |
| 2.224999999999655 | 0.67 |  |  |
| 2.219999999999655 | 0.671 |  |  |
| 2.214999999999655 | 0.672 |  |  |
| 2.209999999999655 | 0.673 |  |  |
| 2.204999999999655 | 0.673 |  |  |
| 2.199999999999656 | 0.674 |  |  |
| 2.194999999999656 | 0.675 |  |  |
| 2.189999999999656 | 0.676 |  |  |
| 2.184999999999656 | 0.677 |  |  |
| 2.179999999999656 | 0.677 |  |  |
| 2.174999999999656 | 0.678 |  |  |
| 2.169999999999656 | 0.679 |  |  |
| 2.164999999999656 | 0.68 |  |  |
| 2.159999999999656 | 0.68 |  |  |
| 2.154999999999657 | 0.681 |  |  |
| 2.149999999999657 | 0.682 |  |  |
| 2.144999999999657 | 0.683 |  |  |
| 2.139999999999657 | 0.684 |  |  |
| 2.134999999999657 | 0.684 |  |  |
| 2.129999999999657 | 0.685 |  |  |
| 2.124999999999657 | 0.686 |  |  |
| 2.119999999999657 | 0.687 |  |  |
| 2.114999999999657 | 0.688 |  |  |
| 2.109999999999657 | 0.688 |  |  |
| 2.104999999999658 | 0.689 |  |  |
| 2.099999999999658 | 0.69 |  |  |
| 2.094999999999658 | 0.691 |  |  |
| 2.089999999999658 | 0.692 |  |  |
| 2.084999999999658 | 0.693 |  |  |
| 2.079999999999658 | 0.693 |  |  |
| 2.074999999999658 | 0.694 |  |  |
| 2.069999999999658 | 0.695 |  |  |
| 2.064999999999658 | 0.696 |  |  |
| 2.059999999999659 | 0.697 |  |  |
| 2.054999999999659 | 0.698 |  |  |
| 2.049999999999659 | 0.698 |  |  |
| 2.044999999999659 | 0.699 |  |  |
| 2.039999999999659 | 0.7 |  |  |
| 2.034999999999659 | 0.701 |  |  |
| 2.029999999999659 | 0.702 |  |  |
| 2.024999999999659 | 0.703 |  |  |
| 2.019999999999659 | 0.704 |  |  |
| 2.01499999999966 | 0.704 |  |  |
| 2.00999999999966 | 0.705 |  |  |
| 2.00499999999966 | 0.706 |  |  |
| 1.99999999999966 | 0.707 |  |  |
| 1.99499999999966 | 0.708 |  |  |
| 1.98999999999966 | 0.709 |  |  |
| 1.98499999999966 | 0.71 |  |  |
| 1.97999999999966 | 0.711 |  |  |
| 1.97499999999966 | 0.712 |  |  |
| 1.96999999999966 | 0.712 |  |  |
| 1.964999999999661 | 0.713 |  |  |
| 1.959999999999661 | 0.714 |  |  |
| 1.954999999999661 | 0.715 |  |  |
| 1.949999999999661 | 0.716 |  |  |
| 1.944999999999661 | 0.717 |  |  |
| 1.939999999999661 | 0.718 |  |  |
| 1.934999999999661 | 0.719 |  |  |
| 1.929999999999661 | 0.72 |  |  |
| 1.924999999999661 | 0.721 |  |  |
| 1.919999999999662 | 0.722 |  |  |
| 1.914999999999662 | 0.723 |  |  |
| 1.909999999999662 | 0.724 |  |  |
| 1.904999999999662 | 0.725 |  |  |
| 1.899999999999662 | 0.725 |  |  |
| 1.894999999999662 | 0.726 |  |  |
| 1.889999999999662 | 0.727 |  |  |
| 1.884999999999662 | 0.728 |  |  |
| 1.879999999999662 | 0.729 |  |  |
| 1.874999999999662 | 0.73 |  |  |
| 1.869999999999663 | 0.731 |  |  |
| 1.864999999999663 | 0.732 |  |  |
| 1.859999999999663 | 0.733 |  |  |
| 1.854999999999663 | 0.734 |  |  |
| 1.849999999999663 | 0.735 |  |  |
| 1.844999999999663 | 0.736 |  |  |
| 1.839999999999663 | 0.737 |  |  |
| 1.834999999999663 | 0.738 |  |  |
| 1.829999999999663 | 0.739 |  |  |
| 1.824999999999664 | 0.74 |  |  |
| 1.819999999999664 | 0.741 |  |  |
| 1.814999999999664 | 0.742 |  |  |
| 1.809999999999664 | 0.743 |  |  |
| 1.804999999999664 | 0.744 |  |  |
| 1.799999999999664 | 0.745 |  |  |
| 1.794999999999664 | 0.746 |  |  |
| 1.789999999999664 | 0.747 |  |  |
| 1.784999999999664 | 0.748 |  |  |
| 1.779999999999664 | 0.75 |  |  |
| 1.774999999999665 | 0.751 |  |  |
| 1.769999999999665 | 0.752 |  |  |
| 1.764999999999665 | 0.753 |  |  |
| 1.759999999999665 | 0.754 |  |  |
| 1.754999999999665 | 0.755 |  |  |
| 1.749999999999665 | 0.756 |  |  |
| 1.744999999999665 | 0.757 |  |  |
| 1.739999999999665 | 0.758 |  |  |
| 1.734999999999665 | 0.759 |  |  |
| 1.729999999999666 | 0.76 |  |  |
| 1.724999999999666 | 0.761 |  |  |
| 1.719999999999666 | 0.762 |  |  |
| 1.714999999999666 | 0.764 |  |  |
| 1.709999999999666 | 0.765 |  |  |
| 1.704999999999666 | 0.766 |  |  |
| 1.699999999999666 | 0.767 |  |  |
| 1.694999999999666 | 0.768 |  |  |
| 1.689999999999666 | 0.769 |  |  |
| 1.684999999999666 | 0.77 |  |  |
| 1.679999999999667 | 0.772 |  |  |
| 1.674999999999667 | 0.773 |  |  |
| 1.669999999999667 | 0.774 |  |  |
| 1.664999999999667 | 0.775 |  |  |
| 1.659999999999667 | 0.776 |  |  |
| 1.654999999999667 | 0.777 |  |  |
| 1.649999999999667 | 0.778 |  |  |
| 1.644999999999667 | 0.78 |  |  |
| 1.639999999999667 | 0.781 |  |  |
| 1.634999999999668 | 0.782 |  |  |
| 1.629999999999668 | 0.783 |  |  |
| 1.624999999999668 | 0.784 |  |  |
| 1.619999999999668 | 0.786 |  |  |
| 1.614999999999668 | 0.787 |  |  |
| 1.609999999999668 | 0.788 |  |  |
| 1.604999999999668 | 0.789 |  |  |
| 1.599999999999668 | 0.791 |  |  |
| 1.594999999999668 | 0.792 |  |  |
| 1.589999999999669 | 0.793 |  |  |
| 1.584999999999669 | 0.794 |  |  |
| 1.579999999999669 | 0.796 |  |  |
| 1.574999999999669 | 0.797 |  |  |
| 1.569999999999669 | 0.798 |  |  |
| 1.564999999999669 | 0.799 |  |  |
| 1.559999999999669 | 0.801 |  |  |
| 1.554999999999669 | 0.802 |  |  |
| 1.549999999999669 | 0.803 |  |  |
| 1.54499999999967 | 0.805 |  |  |
| 1.53999999999967 | 0.806 |  |  |
| 1.53499999999967 | 0.807 |  |  |
| 1.52999999999967 | 0.808 |  |  |
| 1.52499999999967 | 0.81 |  |  |
| 1.51999999999967 | 0.811 |  |  |
| 1.51499999999967 | 0.812 |  |  |
| 1.50999999999967 | 0.814 |  |  |
| 1.50499999999967 | 0.815 |  |  |
| 1.49999999999967 | 0.816 |  |  |
| 1.494999999999671 | 0.818 |  |  |
| 1.489999999999671 | 0.819 |  |  |
| 1.484999999999671 | 0.821 |  |  |
| 1.479999999999671 | 0.822 |  |  |
| 1.474999999999671 | 0.823 |  |  |
| 1.469999999999671 | 0.825 |  |  |
| 1.464999999999671 | 0.826 |  |  |
| 1.459999999999671 | 0.828 |  |  |
| 1.454999999999671 | 0.829 |  |  |
| 1.449999999999672 | 0.83 |  |  |
| 1.444999999999672 | 0.832 |  |  |
| 1.439999999999672 | 0.833 |  |  |
| 1.434999999999672 | 0.835 |  |  |
| 1.429999999999672 | 0.836 |  |  |
| 1.424999999999672 | 0.838 |  |  |
| 1.419999999999672 | 0.839 |  |  |
| 1.414999999999672 | 0.841 |  |  |
| 1.409999999999672 | 0.842 |  |  |
| 1.404999999999672 | 0.844 |  |  |
| 1.399999999999673 | 0.845 |  |  |
| 1.394999999999673 | 0.847 |  |  |
| 1.389999999999673 | 0.848 |  |  |
| 1.384999999999673 | 0.85 |  |  |
| 1.379999999999673 | 0.851 |  |  |
| 1.374999999999673 | 0.853 |  |  |
| 1.369999999999673 | 0.854 |  |  |
| 1.364999999999673 | 0.856 |  |  |
| 1.359999999999673 | 0.857 |  |  |
| 1.354999999999674 | 0.859 |  |  |
| 1.349999999999674 | 0.861 |  |  |
| 1.344999999999674 | 0.862 |  |  |
| 1.339999999999674 | 0.864 |  |  |
| 1.334999999999674 | 0.865 |  |  |
| 1.329999999999674 | 0.867 |  |  |
| 1.324999999999674 | 0.869 |  |  |
| 1.319999999999674 | 0.87 |  |  |
| 1.314999999999674 | 0.872 |  |  |
| 1.309999999999674 | 0.874 |  |  |
| 1.304999999999675 | 0.875 |  |  |
| 1.299999999999675 | 0.877 |  |  |
| 1.294999999999675 | 0.879 |  |  |
| 1.289999999999675 | 0.88 |  |  |
| 1.284999999999675 | 0.882 |  |  |
| 1.279999999999675 | 0.884 |  |  |
| 1.274999999999675 | 0.886 |  |  |
| 1.269999999999675 | 0.887 |  |  |
| 1.264999999999675 | 0.889 |  |  |
| 1.259999999999676 | 0.891 |  |  |
| 1.254999999999676 | 0.893 |  |  |
| 1.249999999999676 | 0.894 |  |  |
| 1.244999999999676 | 0.896 |  |  |
| 1.239999999999676 | 0.898 |  |  |
| 1.234999999999676 | 0.9 |  |  |
| 1.229999999999676 | 0.902 |  |  |
| 1.224999999999676 | 0.904 |  |  |
| 1.219999999999676 | 0.905 |  |  |
| 1.214999999999677 | 0.907 |  |  |
| 1.209999999999677 | 0.909 |  |  |
| 1.204999999999677 | 0.911 |  |  |
| 1.199999999999677 | 0.913 |  |  |
| 1.194999999999677 | 0.915 |  |  |
| 1.189999999999677 | 0.917 |  |  |
| 1.184999999999677 | 0.919 |  |  |
| 1.179999999999677 | 0.921 |  |  |
| 1.174999999999677 | 0.923 |  |  |
| 1.169999999999677 | 0.925 |  |  |
| 1.164999999999678 | 0.926 |  |  |
| 1.159999999999678 | 0.928 |  |  |
| 1.154999999999678 | 0.93 |  |  |
| 1.149999999999678 | 0.933 |  |  |
| 1.144999999999678 | 0.935 |  |  |
| 1.139999999999678 | 0.937 |  |  |
| 1.134999999999678 | 0.939 |  |  |
| 1.129999999999678 | 0.941 |  |  |
| 1.124999999999678 | 0.943 |  |  |
| 1.119999999999679 | 0.945 |  |  |
| 1.114999999999679 | 0.947 |  |  |
| 1.109999999999679 | 0.949 |  |  |
| 1.104999999999679 | 0.951 |  |  |
| 1.099999999999679 | 0.953 |  |  |
| 1.094999999999679 | 0.956 |  |  |
| 1.089999999999679 | 0.958 |  |  |
| 1.084999999999679 | 0.96 |  |  |
| 1.079999999999679 | 0.962 |  |  |
| 1.07499999999968 | 0.964 |  |  |
| 1.06999999999968 | 0.967 |  |  |
| 1.06499999999968 | 0.969 |  |  |
| 1.05999999999968 | 0.971 |  |  |
| 1.05499999999968 | 0.974 |  |  |
| 1.04999999999968 | 0.976 |  |  |
| 1.04499999999968 | 0.978 |  |  |
| 1.03999999999968 | 0.981 |  |  |
| 1.03499999999968 | 0.983 |  |  |
| 1.02999999999968 | 0.985 |  |  |
| 1.024999999999681 | 0.988 |  |  |
| 1.019999999999681 | 0.99 |  |  |
| 1.014999999999681 | 0.993 |  |  |
| 1.009999999999681 | 0.995 |  |  |
| 1.004999999999681 | 0.998 |  |  |
| 0.999999999999681 | 1 |  |  |